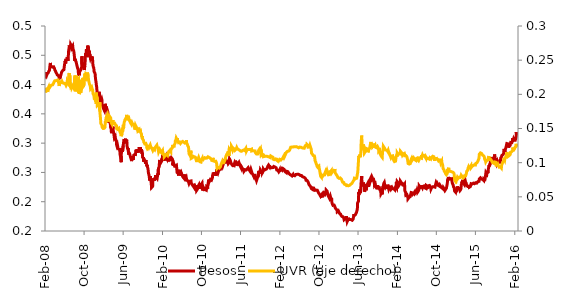
| Category | Pesos |
|---|---|
| 2003-01-02 | 0.508 |
| 2003-01-03 | 0.502 |
| 2003-01-07 | 0.516 |
| 2003-01-08 | 0.505 |
| 2003-01-09 | 0.508 |
| 2003-01-10 | 0.504 |
| 2003-01-13 | 0.498 |
| 2003-01-14 | 0.496 |
| 2003-01-15 | 0.486 |
| 2003-01-16 | 0.492 |
| 2003-01-17 | 0.501 |
| 2003-01-20 | 0.519 |
| 2003-01-21 | 0.519 |
| 2003-01-22 | 0.528 |
| 2003-01-23 | 0.523 |
| 2003-01-24 | 0.523 |
| 2003-01-27 | 0.522 |
| 2003-01-28 | 0.528 |
| 2003-01-29 | 0.524 |
| 2003-01-30 | 0.517 |
| 2003-01-31 | 0.516 |
| 2003-02-03 | 0.527 |
| 2003-02-04 | 0.526 |
| 2003-02-05 | 0.531 |
| 2003-02-06 | 0.538 |
| 2003-02-07 | 0.53 |
| 2003-02-10 | 0.536 |
| 2003-02-11 | 0.538 |
| 2003-02-12 | 0.52 |
| 2003-02-13 | 0.527 |
| 2003-02-14 | 0.528 |
| 2003-02-17 | 0.522 |
| 2003-02-18 | 0.523 |
| 2003-02-19 | 0.523 |
| 2003-02-20 | 0.525 |
| 2003-02-21 | 0.528 |
| 2003-02-24 | 0.53 |
| 2003-02-25 | 0.53 |
| 2003-02-26 | 0.523 |
| 2003-02-27 | 0.53 |
| 2003-02-28 | 0.528 |
| 2003-03-03 | 0.539 |
| 2003-03-04 | 0.536 |
| 2003-03-05 | 0.533 |
| 2003-03-06 | 0.516 |
| 2003-03-07 | 0.529 |
| 2003-03-10 | 0.523 |
| 2003-03-11 | 0.527 |
| 2003-03-12 | 0.529 |
| 2003-03-13 | 0.534 |
| 2003-03-14 | 0.534 |
| 2003-03-17 | 0.527 |
| 2003-03-18 | 0.527 |
| 2003-03-19 | 0.527 |
| 2003-03-20 | 0.526 |
| 2003-03-21 | 0.535 |
| 2003-03-25 | 0.529 |
| 2003-03-26 | 0.528 |
| 2003-03-27 | 0.527 |
| 2003-03-28 | 0.524 |
| 2003-03-31 | 0.536 |
| 2003-04-01 | 0.525 |
| 2003-04-02 | 0.524 |
| 2003-04-03 | 0.536 |
| 2003-04-04 | 0.538 |
| 2003-04-07 | 0.535 |
| 2003-04-08 | 0.538 |
| 2003-04-09 | 0.532 |
| 2003-04-10 | 0.53 |
| 2003-04-11 | 0.54 |
| 2003-04-14 | 0.533 |
| 2003-04-15 | 0.532 |
| 2003-04-16 | 0.536 |
| 2003-04-21 | 0.541 |
| 2003-04-22 | 0.536 |
| 2003-04-23 | 0.524 |
| 2003-04-24 | 0.529 |
| 2003-04-25 | 0.529 |
| 2003-04-28 | 0.537 |
| 2003-04-29 | 0.529 |
| 2003-05-05 | 0.509 |
| 2003-05-06 | 0.502 |
| 2003-05-07 | 0.499 |
| 2003-05-08 | 0.487 |
| 2003-05-09 | 0.495 |
| 2003-05-12 | 0.487 |
| 2003-05-13 | 0.479 |
| 2003-05-14 | 0.491 |
| 2003-05-15 | 0.501 |
| 2003-05-16 | 0.505 |
| 2003-05-19 | 0.53 |
| 2003-05-20 | 0.529 |
| 2003-05-21 | 0.527 |
| 2003-05-22 | 0.514 |
| 2003-05-23 | 0.503 |
| 2003-05-26 | 0.502 |
| 2003-05-27 | 0.503 |
| 2003-05-28 | 0.506 |
| 2003-05-29 | 0.501 |
| 2003-05-30 | 0.498 |
| 2003-06-03 | 0.5 |
| 2003-06-04 | 0.502 |
| 2003-06-05 | 0.503 |
| 2003-06-06 | 0.498 |
| 2003-06-09 | 0.5 |
| 2003-06-10 | 0.506 |
| 2003-06-11 | 0.503 |
| 2003-06-12 | 0.504 |
| 2003-06-13 | 0.505 |
| 2003-06-16 | 0.506 |
| 2003-06-17 | 0.503 |
| 2003-06-18 | 0.499 |
| 2003-06-19 | 0.5 |
| 2003-06-20 | 0.498 |
| 2003-06-24 | 0.496 |
| 2003-06-25 | 0.492 |
| 2003-06-26 | 0.49 |
| 2003-06-27 | 0.49 |
| 2003-07-01 | 0.489 |
| 2003-07-02 | 0.486 |
| 2003-07-03 | 0.488 |
| 2003-07-04 | 0.488 |
| 2003-07-07 | 0.489 |
| 2003-07-08 | 0.504 |
| 2003-07-09 | 0.498 |
| 2003-07-10 | 0.498 |
| 2003-07-11 | 0.498 |
| 2003-07-14 | 0.502 |
| 2003-07-15 | 0.504 |
| 2003-07-16 | 0.508 |
| 2003-07-17 | 0.504 |
| 2003-07-18 | 0.5 |
| 2003-07-21 | 0.501 |
| 2003-07-22 | 0.504 |
| 2003-07-23 | 0.504 |
| 2003-07-24 | 0.506 |
| 2003-07-25 | 0.505 |
| 2003-07-28 | 0.505 |
| 2003-07-29 | 0.504 |
| 2003-07-30 | 0.502 |
| 2003-07-31 | 0.5 |
| 2003-08-01 | 0.502 |
| 2003-08-04 | 0.509 |
| 2003-08-05 | 0.508 |
| 2003-08-06 | 0.505 |
| 2003-08-08 | 0.503 |
| 2003-08-11 | 0.5 |
| 2003-08-12 | 0.499 |
| 2003-08-13 | 0.497 |
| 2003-08-14 | 0.496 |
| 2003-08-15 | 0.496 |
| 2003-08-19 | 0.497 |
| 2003-08-20 | 0.495 |
| 2003-08-21 | 0.495 |
| 2003-08-22 | 0.493 |
| 2003-08-25 | 0.498 |
| 2003-08-26 | 0.499 |
| 2003-08-27 | 0.498 |
| 2003-08-28 | 0.498 |
| 2003-08-29 | 0.493 |
| 2003-09-01 | 0.491 |
| 2003-09-02 | 0.496 |
| 2003-09-03 | 0.491 |
| 2003-09-04 | 0.488 |
| 2003-09-05 | 0.489 |
| 2003-09-08 | 0.493 |
| 2003-09-09 | 0.489 |
| 2003-09-10 | 0.49 |
| 2003-09-11 | 0.488 |
| 2003-09-12 | 0.488 |
| 2003-09-15 | 0.487 |
| 2003-09-16 | 0.486 |
| 2003-09-17 | 0.486 |
| 2003-09-18 | 0.489 |
| 2003-09-19 | 0.492 |
| 2003-09-22 | 0.494 |
| 2003-09-23 | 0.501 |
| 2003-09-24 | 0.499 |
| 2003-09-25 | 0.494 |
| 2003-09-26 | 0.497 |
| 2003-09-29 | 0.505 |
| 2003-09-30 | 0.505 |
| 2003-10-01 | 0.506 |
| 2003-10-02 | 0.503 |
| 2003-10-03 | 0.499 |
| 2003-10-06 | 0.503 |
| 2003-10-07 | 0.503 |
| 2003-10-08 | 0.496 |
| 2003-10-09 | 0.505 |
| 2003-10-10 | 0.506 |
| 2003-10-14 | 0.503 |
| 2003-10-15 | 0.506 |
| 2003-10-16 | 0.503 |
| 2003-10-17 | 0.504 |
| 2003-10-20 | 0.505 |
| 2003-10-21 | 0.504 |
| 2003-10-22 | 0.503 |
| 2003-10-23 | 0.501 |
| 2003-10-24 | 0.493 |
| 2003-10-27 | 0.501 |
| 2003-10-28 | 0.5 |
| 2003-10-29 | 0.493 |
| 2003-10-30 | 0.499 |
| 2003-10-31 | 0.493 |
| 2003-11-04 | 0.494 |
| 2003-11-05 | 0.491 |
| 2003-11-06 | 0.492 |
| 2003-11-07 | 0.491 |
| 2003-11-10 | 0.491 |
| 2003-11-11 | 0.49 |
| 2003-11-12 | 0.488 |
| 2003-11-13 | 0.488 |
| 2003-11-14 | 0.488 |
| 2003-11-18 | 0.486 |
| 2003-11-19 | 0.486 |
| 2003-11-20 | 0.489 |
| 2003-11-21 | 0.489 |
| 2003-11-24 | 0.486 |
| 2003-11-25 | 0.484 |
| 2003-11-26 | 0.483 |
| 2003-11-27 | 0.484 |
| 2003-11-28 | 0.486 |
| 2003-11-30 | 0.486 |
| 2003-12-01 | 0.486 |
| 2003-12-02 | 0.487 |
| 2003-12-03 | 0.489 |
| 2003-12-04 | 0.489 |
| 2003-12-05 | 0.489 |
| 2003-12-09 | 0.49 |
| 2003-12-10 | 0.486 |
| 2003-12-11 | 0.488 |
| 2003-12-12 | 0.489 |
| 2003-12-15 | 0.491 |
| 2003-12-16 | 0.491 |
| 2003-12-17 | 0.49 |
| 2003-12-18 | 0.49 |
| 2003-12-19 | 0.49 |
| 2003-12-22 | 0.487 |
| 2003-12-23 | 0.489 |
| 2003-12-24 | 0.489 |
| 2003-12-26 | 0.488 |
| 2003-12-29 | 0.49 |
| 2003-12-31 | 0.495 |
| 2004-01-02 | 0.486 |
| 2004-01-05 | 0.485 |
| 2004-01-06 | 0.481 |
| 2004-01-07 | 0.477 |
| 2004-01-08 | 0.476 |
| 2004-01-09 | 0.478 |
| 2004-01-13 | 0.477 |
| 2004-01-14 | 0.471 |
| 2004-01-15 | 0.472 |
| 2004-01-16 | 0.478 |
| 2004-01-19 | 0.482 |
| 2004-01-20 | 0.478 |
| 2004-01-21 | 0.478 |
| 2004-01-22 | 0.48 |
| 2004-01-23 | 0.481 |
| 2004-01-26 | 0.483 |
| 2004-01-27 | 0.478 |
| 2004-01-28 | 0.476 |
| 2004-01-29 | 0.481 |
| 2004-01-30 | 0.481 |
| 2004-01-31 | 0.481 |
| 2004-02-02 | 0.481 |
| 2004-02-03 | 0.481 |
| 2004-02-04 | 0.478 |
| 2004-02-05 | 0.476 |
| 2004-02-06 | 0.477 |
| 2004-02-09 | 0.475 |
| 2004-02-10 | 0.475 |
| 2004-02-11 | 0.475 |
| 2004-02-12 | 0.472 |
| 2004-02-13 | 0.47 |
| 2004-02-16 | 0.471 |
| 2004-02-17 | 0.472 |
| 2004-02-18 | 0.469 |
| 2004-02-19 | 0.468 |
| 2004-02-20 | 0.466 |
| 2004-02-23 | 0.461 |
| 2004-02-24 | 0.457 |
| 2004-02-25 | 0.463 |
| 2004-02-26 | 0.458 |
| 2004-02-27 | 0.453 |
| 2004-02-29 | 0.453 |
| 2004-03-01 | 0.457 |
| 2004-03-02 | 0.455 |
| 2004-03-03 | 0.45 |
| 2004-03-04 | 0.449 |
| 2004-03-05 | 0.442 |
| 2004-03-06 | 0.442 |
| 2004-03-07 | 0.442 |
| 2004-03-08 | 0.44 |
| 2004-03-09 | 0.44 |
| 2004-03-10 | 0.446 |
| 2004-03-11 | 0.444 |
| 2004-03-12 | 0.444 |
| 2004-03-13 | 0.444 |
| 2004-03-14 | 0.444 |
| 2004-03-15 | 0.44 |
| 2004-03-16 | 0.439 |
| 2004-03-17 | 0.436 |
| 2004-03-18 | 0.436 |
| 2004-03-19 | 0.436 |
| 2004-03-20 | 0.436 |
| 2004-03-21 | 0.436 |
| 2004-03-22 | 0.436 |
| 2004-03-23 | 0.437 |
| 2004-03-24 | 0.435 |
| 2004-03-25 | 0.434 |
| 2004-03-26 | 0.43 |
| 2004-03-27 | 0.43 |
| 2004-03-28 | 0.43 |
| 2004-03-29 | 0.432 |
| 2004-03-30 | 0.431 |
| 2004-03-31 | 0.429 |
| 2004-04-01 | 0.427 |
| 2004-04-02 | 0.43 |
| 2004-04-03 | 0.43 |
| 2004-04-04 | 0.43 |
| 2004-04-05 | 0.432 |
| 2004-04-06 | 0.431 |
| 2004-04-07 | 0.429 |
| 2004-04-08 | 0.429 |
| 2004-04-09 | 0.429 |
| 2004-04-10 | 0.429 |
| 2004-04-11 | 0.429 |
| 2004-04-12 | 0.429 |
| 2004-04-13 | 0.429 |
| 2004-04-14 | 0.43 |
| 2004-04-15 | 0.436 |
| 2004-04-16 | 0.446 |
| 2004-04-17 | 0.446 |
| 2004-04-18 | 0.446 |
| 2004-04-19 | 0.441 |
| 2004-04-20 | 0.454 |
| 2004-04-21 | 0.446 |
| 2004-04-22 | 0.444 |
| 2004-04-23 | 0.443 |
| 2004-04-24 | 0.443 |
| 2004-04-25 | 0.443 |
| 2004-04-26 | 0.442 |
| 2004-04-27 | 0.442 |
| 2004-04-28 | 0.447 |
| 2004-04-29 | 0.452 |
| 2004-04-30 | 0.455 |
| 2004-05-01 | 0.455 |
| 2004-05-02 | 0.455 |
| 2004-05-03 | 0.457 |
| 2004-05-04 | 0.47 |
| 2004-05-05 | 0.471 |
| 2004-05-06 | 0.496 |
| 2004-05-07 | 0.508 |
| 2004-05-08 | 0.508 |
| 2004-05-09 | 0.508 |
| 2004-05-10 | 0.514 |
| 2004-05-11 | 0.503 |
| 2004-05-12 | 0.499 |
| 2004-05-13 | 0.498 |
| 2004-05-14 | 0.489 |
| 2004-05-15 | 0.489 |
| 2004-05-16 | 0.489 |
| 2004-05-17 | 0.484 |
| 2004-05-18 | 0.484 |
| 2004-05-19 | 0.487 |
| 2004-05-20 | 0.492 |
| 2004-05-21 | 0.494 |
| 2004-05-22 | 0.494 |
| 2004-05-23 | 0.494 |
| 2004-05-24 | 0.494 |
| 2004-05-25 | 0.484 |
| 2004-05-26 | 0.486 |
| 2004-05-27 | 0.483 |
| 2004-05-28 | 0.479 |
| 2004-05-29 | 0.479 |
| 2004-05-30 | 0.479 |
| 2004-05-31 | 0.478 |
| 2004-06-01 | 0.483 |
| 2004-06-02 | 0.481 |
| 2004-06-03 | 0.478 |
| 2004-06-04 | 0.475 |
| 2004-06-05 | 0.475 |
| 2004-06-06 | 0.475 |
| 2004-06-07 | 0.471 |
| 2004-06-08 | 0.476 |
| 2004-06-09 | 0.481 |
| 2004-06-10 | 0.49 |
| 2004-06-11 | 0.488 |
| 2004-06-12 | 0.488 |
| 2004-06-13 | 0.488 |
| 2004-06-14 | 0.488 |
| 2004-06-15 | 0.486 |
| 2004-06-16 | 0.486 |
| 2004-06-17 | 0.485 |
| 2004-06-18 | 0.484 |
| 2004-06-19 | 0.484 |
| 2004-06-20 | 0.484 |
| 2004-06-21 | 0.484 |
| 2004-06-22 | 0.484 |
| 2004-06-23 | 0.486 |
| 2004-06-24 | 0.484 |
| 2004-06-25 | 0.483 |
| 2004-06-26 | 0.483 |
| 2004-06-27 | 0.483 |
| 2004-06-28 | 0.485 |
| 2004-06-29 | 0.486 |
| 2004-06-30 | 0.485 |
| 2004-07-01 | 0.476 |
| 2004-07-02 | 0.476 |
| 2004-07-03 | 0.476 |
| 2004-07-04 | 0.476 |
| 2004-07-05 | 0.476 |
| 2004-07-06 | 0.48 |
| 2004-07-07 | 0.481 |
| 2004-07-08 | 0.48 |
| 2004-07-09 | 0.48 |
| 2004-07-10 | 0.48 |
| 2004-07-11 | 0.48 |
| 2004-07-12 | 0.481 |
| 2004-07-13 | 0.481 |
| 2004-07-14 | 0.48 |
| 2004-07-15 | 0.48 |
| 2004-07-16 | 0.48 |
| 2004-07-17 | 0.48 |
| 2004-07-18 | 0.48 |
| 2004-07-19 | 0.48 |
| 2004-07-20 | 0.48 |
| 2004-07-21 | 0.483 |
| 2004-07-22 | 0.483 |
| 2004-07-23 | 0.482 |
| 2004-07-24 | 0.482 |
| 2004-07-25 | 0.482 |
| 2004-07-26 | 0.486 |
| 2004-07-27 | 0.487 |
| 2004-07-28 | 0.485 |
| 2004-07-29 | 0.485 |
| 2004-07-30 | 0.485 |
| 2004-07-31 | 0.485 |
| 2004-08-01 | 0.485 |
| 2004-08-02 | 0.486 |
| 2004-08-03 | 0.492 |
| 2004-08-04 | 0.492 |
| 2004-08-05 | 0.491 |
| 2004-08-06 | 0.49 |
| 2004-08-07 | 0.49 |
| 2004-08-08 | 0.49 |
| 2004-08-09 | 0.485 |
| 2004-08-10 | 0.484 |
| 2004-08-11 | 0.485 |
| 2004-08-12 | 0.491 |
| 2004-08-13 | 0.485 |
| 2004-08-14 | 0.485 |
| 2004-08-15 | 0.485 |
| 2004-08-16 | 0.485 |
| 2004-08-17 | 0.483 |
| 2004-08-18 | 0.484 |
| 2004-08-19 | 0.484 |
| 2004-08-20 | 0.482 |
| 2004-08-21 | 0.482 |
| 2004-08-22 | 0.482 |
| 2004-08-23 | 0.479 |
| 2004-08-24 | 0.474 |
| 2004-08-25 | 0.473 |
| 2004-08-26 | 0.478 |
| 2004-08-27 | 0.478 |
| 2004-08-28 | 0.478 |
| 2004-08-29 | 0.478 |
| 2004-08-30 | 0.474 |
| 2004-08-31 | 0.472 |
| 2004-09-01 | 0.473 |
| 2004-09-02 | 0.48 |
| 2004-09-03 | 0.478 |
| 2004-09-04 | 0.478 |
| 2004-09-05 | 0.478 |
| 2004-09-06 | 0.48 |
| 2004-09-07 | 0.479 |
| 2004-09-08 | 0.473 |
| 2004-09-09 | 0.464 |
| 2004-09-10 | 0.469 |
| 2004-09-11 | 0.469 |
| 2004-09-12 | 0.469 |
| 2004-09-13 | 0.458 |
| 2004-09-14 | 0.453 |
| 2004-09-15 | 0.458 |
| 2004-09-16 | 0.453 |
| 2004-09-17 | 0.452 |
| 2004-09-18 | 0.452 |
| 2004-09-19 | 0.452 |
| 2004-09-20 | 0.459 |
| 2004-09-21 | 0.461 |
| 2004-09-22 | 0.459 |
| 2004-09-23 | 0.461 |
| 2004-09-24 | 0.469 |
| 2004-09-25 | 0.469 |
| 2004-09-26 | 0.469 |
| 2004-09-27 | 0.469 |
| 2004-09-28 | 0.47 |
| 2004-09-29 | 0.467 |
| 2004-09-30 | 0.468 |
| 2004-10-01 | 0.469 |
| 2004-10-02 | 0.469 |
| 2004-10-03 | 0.469 |
| 2004-10-04 | 0.472 |
| 2004-10-05 | 0.466 |
| 2004-10-06 | 0.463 |
| 2004-10-07 | 0.461 |
| 2004-10-08 | 0.457 |
| 2004-10-09 | 0.457 |
| 2004-10-10 | 0.457 |
| 2004-10-11 | 0.459 |
| 2004-10-12 | 0.461 |
| 2004-10-13 | 0.456 |
| 2004-10-14 | 0.456 |
| 2004-10-15 | 0.45 |
| 2004-10-16 | 0.45 |
| 2004-10-17 | 0.45 |
| 2004-10-18 | 0.45 |
| 2004-10-19 | 0.45 |
| 2004-10-20 | 0.45 |
| 2004-10-21 | 0.451 |
| 2004-10-22 | 0.45 |
| 2004-10-23 | 0.45 |
| 2004-10-24 | 0.45 |
| 2004-10-25 | 0.45 |
| 2004-10-26 | 0.451 |
| 2004-10-27 | 0.452 |
| 2004-10-28 | 0.456 |
| 2004-10-29 | 0.457 |
| 2004-10-30 | 0.457 |
| 2004-10-31 | 0.457 |
| 2004-11-01 | 0.457 |
| 2004-11-02 | 0.452 |
| 2004-11-03 | 0.452 |
| 2004-11-04 | 0.452 |
| 2004-11-05 | 0.451 |
| 2004-11-06 | 0.451 |
| 2004-11-07 | 0.451 |
| 2004-11-08 | 0.45 |
| 2004-11-09 | 0.449 |
| 2004-11-10 | 0.45 |
| 2004-11-11 | 0.449 |
| 2004-11-12 | 0.447 |
| 2004-11-13 | 0.447 |
| 2004-11-14 | 0.447 |
| 2004-11-15 | 0.447 |
| 2004-11-16 | 0.445 |
| 2004-11-17 | 0.443 |
| 2004-11-18 | 0.441 |
| 2004-11-19 | 0.441 |
| 2004-11-20 | 0.441 |
| 2004-11-21 | 0.441 |
| 2004-11-22 | 0.441 |
| 2004-11-23 | 0.44 |
| 2004-11-24 | 0.436 |
| 2004-11-25 | 0.434 |
| 2004-11-26 | 0.429 |
| 2004-11-27 | 0.429 |
| 2004-11-28 | 0.429 |
| 2004-11-29 | 0.436 |
| 2004-11-30 | 0.436 |
| 2004-12-01 | 0.439 |
| 2004-12-02 | 0.443 |
| 2004-12-03 | 0.441 |
| 2004-12-04 | 0.441 |
| 2004-12-05 | 0.441 |
| 2004-12-06 | 0.441 |
| 2004-12-07 | 0.442 |
| 2004-12-08 | 0.442 |
| 2004-12-09 | 0.45 |
| 2004-12-10 | 0.445 |
| 2004-12-11 | 0.445 |
| 2004-12-12 | 0.445 |
| 2004-12-13 | 0.443 |
| 2004-12-14 | 0.443 |
| 2004-12-15 | 0.443 |
| 2004-12-16 | 0.44 |
| 2004-12-17 | 0.439 |
| 2004-12-18 | 0.439 |
| 2004-12-19 | 0.439 |
| 2004-12-20 | 0.431 |
| 2004-12-21 | 0.43 |
| 2004-12-22 | 0.427 |
| 2004-12-23 | 0.427 |
| 2004-12-24 | 0.428 |
| 2004-12-25 | 0.428 |
| 2004-12-26 | 0.428 |
| 2004-12-27 | 0.426 |
| 2004-12-28 | 0.426 |
| 2004-12-29 | 0.427 |
| 2004-12-30 | 0.426 |
| 2004-12-31 | 0.426 |
| 2005-01-01 | 0.426 |
| 2005-01-02 | 0.426 |
| 2005-01-03 | 0.417 |
| 2005-01-04 | 0.412 |
| 2005-01-05 | 0.415 |
| 2005-01-06 | 0.421 |
| 2005-01-07 | 0.419 |
| 2005-01-08 | 0.419 |
| 2005-01-09 | 0.419 |
| 2005-01-10 | 0.419 |
| 2005-01-11 | 0.42 |
| 2005-01-12 | 0.414 |
| 2005-01-13 | 0.411 |
| 2005-01-14 | 0.414 |
| 2005-01-15 | 0.414 |
| 2005-01-16 | 0.414 |
| 2005-01-17 | 0.42 |
| 2005-01-18 | 0.417 |
| 2005-01-19 | 0.415 |
| 2005-01-20 | 0.417 |
| 2005-01-21 | 0.415 |
| 2005-01-22 | 0.415 |
| 2005-01-23 | 0.415 |
| 2005-01-24 | 0.415 |
| 2005-01-25 | 0.408 |
| 2005-01-26 | 0.408 |
| 2005-01-27 | 0.41 |
| 2005-01-28 | 0.408 |
| 2005-01-29 | 0.408 |
| 2005-01-30 | 0.408 |
| 2005-01-31 | 0.407 |
| 2005-02-01 | 0.407 |
| 2005-02-02 | 0.407 |
| 2005-02-03 | 0.41 |
| 2005-02-04 | 0.409 |
| 2005-02-05 | 0.409 |
| 2005-02-06 | 0.409 |
| 2005-02-07 | 0.408 |
| 2005-02-08 | 0.408 |
| 2005-02-09 | 0.406 |
| 2005-02-10 | 0.405 |
| 2005-02-11 | 0.405 |
| 2005-02-12 | 0.405 |
| 2005-02-13 | 0.405 |
| 2005-02-14 | 0.404 |
| 2005-02-15 | 0.403 |
| 2005-02-16 | 0.404 |
| 2005-02-17 | 0.4 |
| 2005-02-18 | 0.401 |
| 2005-02-19 | 0.401 |
| 2005-02-20 | 0.401 |
| 2005-02-21 | 0.401 |
| 2005-02-22 | 0.4 |
| 2005-02-23 | 0.402 |
| 2005-02-24 | 0.402 |
| 2005-02-25 | 0.404 |
| 2005-02-26 | 0.404 |
| 2005-02-27 | 0.404 |
| 2005-02-28 | 0.402 |
| 2005-03-01 | 0.403 |
| 2005-03-02 | 0.405 |
| 2005-03-03 | 0.404 |
| 2005-03-04 | 0.404 |
| 2005-03-05 | 0.404 |
| 2005-03-06 | 0.404 |
| 2005-03-07 | 0.401 |
| 2005-03-08 | 0.403 |
| 2005-03-09 | 0.403 |
| 2005-03-10 | 0.403 |
| 2005-03-11 | 0.405 |
| 2005-03-12 | 0.405 |
| 2005-03-13 | 0.405 |
| 2005-03-14 | 0.41 |
| 2005-03-15 | 0.411 |
| 2005-03-16 | 0.416 |
| 2005-03-17 | 0.411 |
| 2005-03-18 | 0.415 |
| 2005-03-19 | 0.415 |
| 2005-03-20 | 0.415 |
| 2005-03-21 | 0.415 |
| 2005-03-22 | 0.411 |
| 2005-03-23 | 0.415 |
| 2005-03-24 | 0.415 |
| 2005-03-25 | 0.415 |
| 2005-03-26 | 0.415 |
| 2005-03-27 | 0.415 |
| 2005-03-28 | 0.427 |
| 2005-03-29 | 0.425 |
| 2005-03-30 | 0.42 |
| 2005-03-31 | 0.416 |
| 2005-04-01 | 0.416 |
| 2005-04-02 | 0.416 |
| 2005-04-03 | 0.416 |
| 2005-04-04 | 0.416 |
| 2005-04-05 | 0.417 |
| 2005-04-06 | 0.415 |
| 2005-04-07 | 0.412 |
| 2005-04-08 | 0.415 |
| 2005-04-09 | 0.415 |
| 2005-04-10 | 0.415 |
| 2005-04-11 | 0.413 |
| 2005-04-12 | 0.415 |
| 2005-04-13 | 0.408 |
| 2005-04-14 | 0.411 |
| 2005-04-15 | 0.41 |
| 2005-04-16 | 0.41 |
| 2005-04-17 | 0.41 |
| 2005-04-18 | 0.412 |
| 2005-04-19 | 0.41 |
| 2005-04-20 | 0.41 |
| 2005-04-21 | 0.409 |
| 2005-04-22 | 0.409 |
| 2005-04-23 | 0.409 |
| 2005-04-24 | 0.409 |
| 2005-04-25 | 0.407 |
| 2005-04-26 | 0.405 |
| 2005-04-27 | 0.402 |
| 2005-04-28 | 0.403 |
| 2005-04-29 | 0.403 |
| 2005-04-30 | 0.403 |
| 2005-05-01 | 0.403 |
| 2005-05-02 | 0.403 |
| 2005-05-03 | 0.401 |
| 2005-05-04 | 0.398 |
| 2005-05-05 | 0.399 |
| 2005-05-06 | 0.399 |
| 2005-05-07 | 0.399 |
| 2005-05-08 | 0.399 |
| 2005-05-09 | 0.399 |
| 2005-05-10 | 0.4 |
| 2005-05-11 | 0.402 |
| 2005-05-12 | 0.401 |
| 2005-05-13 | 0.401 |
| 2005-05-14 | 0.401 |
| 2005-05-15 | 0.401 |
| 2005-05-16 | 0.4 |
| 2005-05-17 | 0.397 |
| 2005-05-18 | 0.397 |
| 2005-05-19 | 0.395 |
| 2005-05-20 | 0.394 |
| 2005-05-21 | 0.394 |
| 2005-05-22 | 0.394 |
| 2005-05-23 | 0.394 |
| 2005-05-24 | 0.393 |
| 2005-05-25 | 0.392 |
| 2005-05-26 | 0.392 |
| 2005-05-27 | 0.392 |
| 2005-05-28 | 0.392 |
| 2005-05-29 | 0.392 |
| 2005-05-30 | 0.392 |
| 2005-05-31 | 0.393 |
| 2005-06-01 | 0.387 |
| 2005-06-02 | 0.384 |
| 2005-06-03 | 0.383 |
| 2005-06-04 | 0.383 |
| 2005-06-05 | 0.383 |
| 2005-06-06 | 0.383 |
| 2005-06-07 | 0.385 |
| 2005-06-08 | 0.389 |
| 2005-06-09 | 0.392 |
| 2005-06-10 | 0.389 |
| 2005-06-11 | 0.389 |
| 2005-06-12 | 0.389 |
| 2005-06-13 | 0.386 |
| 2005-06-14 | 0.382 |
| 2005-06-15 | 0.383 |
| 2005-06-16 | 0.381 |
| 2005-06-17 | 0.378 |
| 2005-06-18 | 0.378 |
| 2005-06-19 | 0.378 |
| 2005-06-20 | 0.378 |
| 2005-06-21 | 0.374 |
| 2005-06-22 | 0.371 |
| 2005-06-23 | 0.369 |
| 2005-06-24 | 0.369 |
| 2005-06-25 | 0.369 |
| 2005-06-26 | 0.369 |
| 2005-06-27 | 0.369 |
| 2005-06-28 | 0.371 |
| 2005-06-29 | 0.372 |
| 2005-06-30 | 0.37 |
| 2005-07-01 | 0.365 |
| 2005-07-02 | 0.365 |
| 2005-07-03 | 0.365 |
| 2005-07-04 | 0.365 |
| 2005-07-05 | 0.367 |
| 2005-07-06 | 0.365 |
| 2005-07-07 | 0.357 |
| 2005-07-08 | 0.351 |
| 2005-07-09 | 0.351 |
| 2005-07-10 | 0.351 |
| 2005-07-11 | 0.344 |
| 2005-07-12 | 0.34 |
| 2005-07-13 | 0.345 |
| 2005-07-14 | 0.344 |
| 2005-07-15 | 0.351 |
| 2005-07-16 | 0.351 |
| 2005-07-17 | 0.351 |
| 2005-07-18 | 0.35 |
| 2005-07-19 | 0.35 |
| 2005-07-20 | 0.35 |
| 2005-07-21 | 0.356 |
| 2005-07-22 | 0.355 |
| 2005-07-23 | 0.355 |
| 2005-07-24 | 0.355 |
| 2005-07-25 | 0.352 |
| 2005-07-26 | 0.352 |
| 2005-07-27 | 0.339 |
| 2005-07-28 | 0.339 |
| 2005-07-29 | 0.336 |
| 2005-07-30 | 0.336 |
| 2005-07-31 | 0.336 |
| 2005-08-01 | 0.34 |
| 2005-08-02 | 0.337 |
| 2005-08-03 | 0.334 |
| 2005-08-04 | 0.335 |
| 2005-08-05 | 0.335 |
| 2005-08-06 | 0.335 |
| 2005-08-07 | 0.335 |
| 2005-08-08 | 0.337 |
| 2005-08-09 | 0.338 |
| 2005-08-10 | 0.335 |
| 2005-08-11 | 0.335 |
| 2005-08-12 | 0.334 |
| 2005-08-13 | 0.334 |
| 2005-08-14 | 0.334 |
| 2005-08-15 | 0.334 |
| 2005-08-16 | 0.335 |
| 2005-08-17 | 0.336 |
| 2005-08-18 | 0.336 |
| 2005-08-19 | 0.338 |
| 2005-08-20 | 0.338 |
| 2005-08-21 | 0.338 |
| 2005-08-22 | 0.338 |
| 2005-08-23 | 0.337 |
| 2005-08-24 | 0.336 |
| 2005-08-25 | 0.339 |
| 2005-08-26 | 0.338 |
| 2005-08-27 | 0.338 |
| 2005-08-28 | 0.338 |
| 2005-08-29 | 0.333 |
| 2005-08-30 | 0.334 |
| 2005-08-31 | 0.333 |
| 2005-09-01 | 0.334 |
| 2005-09-02 | 0.331 |
| 2005-09-03 | 0.331 |
| 2005-09-04 | 0.331 |
| 2005-09-05 | 0.329 |
| 2005-09-06 | 0.326 |
| 2005-09-07 | 0.323 |
| 2005-09-08 | 0.322 |
| 2005-09-09 | 0.324 |
| 2005-09-10 | 0.324 |
| 2005-09-11 | 0.324 |
| 2005-09-12 | 0.324 |
| 2005-09-13 | 0.319 |
| 2005-09-14 | 0.314 |
| 2005-09-15 | 0.314 |
| 2005-09-16 | 0.314 |
| 2005-09-17 | 0.314 |
| 2005-09-18 | 0.314 |
| 2005-09-19 | 0.302 |
| 2005-09-20 | 0.302 |
| 2005-09-21 | 0.297 |
| 2005-09-22 | 0.295 |
| 2005-09-23 | 0.292 |
| 2005-09-24 | 0.292 |
| 2005-09-25 | 0.292 |
| 2005-09-26 | 0.286 |
| 2005-09-27 | 0.284 |
| 2005-09-28 | 0.284 |
| 2005-09-29 | 0.28 |
| 2005-09-30 | 0.276 |
| 2005-10-01 | 0.276 |
| 2005-10-02 | 0.276 |
| 2005-10-03 | 0.276 |
| 2005-10-04 | 0.271 |
| 2005-10-05 | 0.277 |
| 2005-10-06 | 0.286 |
| 2005-10-07 | 0.293 |
| 2005-10-08 | 0.293 |
| 2005-10-09 | 0.293 |
| 2005-10-10 | 0.296 |
| 2005-10-11 | 0.305 |
| 2005-10-12 | 0.311 |
| 2005-10-13 | 0.308 |
| 2005-10-14 | 0.306 |
| 2005-10-15 | 0.306 |
| 2005-10-16 | 0.306 |
| 2005-10-17 | 0.306 |
| 2005-10-18 | 0.303 |
| 2005-10-19 | 0.293 |
| 2005-10-20 | 0.29 |
| 2005-10-21 | 0.296 |
| 2005-10-22 | 0.296 |
| 2005-10-23 | 0.296 |
| 2005-10-24 | 0.293 |
| 2005-10-25 | 0.293 |
| 2005-10-26 | 0.297 |
| 2005-10-27 | 0.301 |
| 2005-10-28 | 0.306 |
| 2005-10-29 | 0.306 |
| 2005-10-30 | 0.306 |
| 2005-10-31 | 0.305 |
| 2005-11-01 | 0.304 |
| 2005-11-02 | 0.304 |
| 2005-11-03 | 0.304 |
| 2005-11-04 | 0.306 |
| 2005-11-05 | 0.306 |
| 2005-11-06 | 0.306 |
| 2005-11-07 | 0.306 |
| 2005-11-08 | 0.305 |
| 2005-11-09 | 0.306 |
| 2005-11-10 | 0.307 |
| 2005-11-11 | 0.306 |
| 2005-11-12 | 0.306 |
| 2005-11-13 | 0.306 |
| 2005-11-14 | 0.306 |
| 2005-11-15 | 0.308 |
| 2005-11-16 | 0.304 |
| 2005-11-17 | 0.301 |
| 2005-11-18 | 0.3 |
| 2005-11-19 | 0.3 |
| 2005-11-20 | 0.3 |
| 2005-11-21 | 0.297 |
| 2005-11-22 | 0.292 |
| 2005-11-23 | 0.285 |
| 2005-11-24 | 0.286 |
| 2005-11-25 | 0.283 |
| 2005-11-26 | 0.283 |
| 2005-11-27 | 0.283 |
| 2005-11-28 | 0.281 |
| 2005-11-29 | 0.286 |
| 2005-11-30 | 0.291 |
| 2005-12-01 | 0.287 |
| 2005-12-02 | 0.288 |
| 2005-12-03 | 0.288 |
| 2005-12-04 | 0.288 |
| 2005-12-05 | 0.291 |
| 2005-12-06 | 0.294 |
| 2005-12-07 | 0.293 |
| 2005-12-08 | 0.293 |
| 2005-12-09 | 0.293 |
| 2005-12-10 | 0.293 |
| 2005-12-11 | 0.293 |
| 2005-12-12 | 0.293 |
| 2005-12-13 | 0.293 |
| 2005-12-14 | 0.29 |
| 2005-12-15 | 0.291 |
| 2005-12-16 | 0.291 |
| 2005-12-17 | 0.291 |
| 2005-12-18 | 0.291 |
| 2005-12-19 | 0.294 |
| 2005-12-20 | 0.294 |
| 2005-12-21 | 0.293 |
| 2005-12-22 | 0.292 |
| 2005-12-23 | 0.291 |
| 2005-12-24 | 0.291 |
| 2005-12-25 | 0.291 |
| 2005-12-26 | 0.291 |
| 2005-12-27 | 0.292 |
| 2005-12-28 | 0.29 |
| 2005-12-29 | 0.291 |
| 2005-12-30 | 0.291 |
| 2005-12-31 | 0.291 |
| 2006-01-01 | 0.291 |
| 2006-01-02 | 0.288 |
| 2006-01-03 | 0.289 |
| 2006-01-04 | 0.288 |
| 2006-01-05 | 0.287 |
| 2006-01-06 | 0.287 |
| 2006-01-07 | 0.287 |
| 2006-01-08 | 0.287 |
| 2006-01-09 | 0.287 |
| 2006-01-10 | 0.284 |
| 2006-01-11 | 0.282 |
| 2006-01-12 | 0.28 |
| 2006-01-13 | 0.278 |
| 2006-01-14 | 0.278 |
| 2006-01-15 | 0.278 |
| 2006-01-16 | 0.277 |
| 2006-01-17 | 0.277 |
| 2006-01-18 | 0.277 |
| 2006-01-19 | 0.277 |
| 2006-01-20 | 0.275 |
| 2006-01-21 | 0.275 |
| 2006-01-22 | 0.275 |
| 2006-01-23 | 0.275 |
| 2006-01-24 | 0.273 |
| 2006-01-25 | 0.273 |
| 2006-01-26 | 0.274 |
| 2006-01-27 | 0.273 |
| 2006-01-28 | 0.273 |
| 2006-01-29 | 0.273 |
| 2006-01-30 | 0.273 |
| 2006-01-31 | 0.274 |
| 2006-02-01 | 0.274 |
| 2006-02-02 | 0.273 |
| 2006-02-03 | 0.272 |
| 2006-02-04 | 0.272 |
| 2006-02-05 | 0.272 |
| 2006-02-06 | 0.271 |
| 2006-02-07 | 0.268 |
| 2006-02-08 | 0.267 |
| 2006-02-09 | 0.266 |
| 2006-02-10 | 0.264 |
| 2006-02-11 | 0.264 |
| 2006-02-12 | 0.264 |
| 2006-02-13 | 0.263 |
| 2006-02-14 | 0.262 |
| 2006-02-15 | 0.262 |
| 2006-02-16 | 0.26 |
| 2006-02-17 | 0.257 |
| 2006-02-18 | 0.257 |
| 2006-02-19 | 0.257 |
| 2006-02-20 | 0.256 |
| 2006-02-21 | 0.256 |
| 2006-02-22 | 0.256 |
| 2006-02-23 | 0.251 |
| 2006-02-24 | 0.251 |
| 2006-02-25 | 0.251 |
| 2006-02-26 | 0.251 |
| 2006-02-27 | 0.251 |
| 2006-02-28 | 0.251 |
| 2006-03-01 | 0.251 |
| 2006-03-02 | 0.252 |
| 2006-03-03 | 0.255 |
| 2006-03-04 | 0.255 |
| 2006-03-05 | 0.255 |
| 2006-03-06 | 0.261 |
| 2006-03-07 | 0.263 |
| 2006-03-08 | 0.262 |
| 2006-03-09 | 0.262 |
| 2006-03-10 | 0.267 |
| 2006-03-11 | 0.267 |
| 2006-03-12 | 0.267 |
| 2006-03-13 | 0.266 |
| 2006-03-14 | 0.262 |
| 2006-03-15 | 0.261 |
| 2006-03-16 | 0.259 |
| 2006-03-17 | 0.258 |
| 2006-03-18 | 0.258 |
| 2006-03-19 | 0.258 |
| 2006-03-20 | 0.258 |
| 2006-03-21 | 0.259 |
| 2006-03-22 | 0.26 |
| 2006-03-23 | 0.263 |
| 2006-03-24 | 0.263 |
| 2006-03-25 | 0.263 |
| 2006-03-26 | 0.263 |
| 2006-03-27 | 0.263 |
| 2006-03-28 | 0.263 |
| 2006-03-29 | 0.263 |
| 2006-03-30 | 0.265 |
| 2006-03-31 | 0.265 |
| 2006-04-01 | 0.265 |
| 2006-04-02 | 0.265 |
| 2006-04-03 | 0.267 |
| 2006-04-04 | 0.265 |
| 2006-04-05 | 0.266 |
| 2006-04-06 | 0.27 |
| 2006-04-07 | 0.272 |
| 2006-04-08 | 0.272 |
| 2006-04-09 | 0.272 |
| 2006-04-10 | 0.28 |
| 2006-04-11 | 0.28 |
| 2006-04-12 | 0.278 |
| 2006-04-13 | 0.278 |
| 2006-04-14 | 0.278 |
| 2006-04-15 | 0.278 |
| 2006-04-16 | 0.278 |
| 2006-04-17 | 0.29 |
| 2006-04-18 | 0.289 |
| 2006-04-19 | 0.286 |
| 2006-04-20 | 0.283 |
| 2006-04-21 | 0.282 |
| 2006-04-22 | 0.282 |
| 2006-04-23 | 0.282 |
| 2006-04-24 | 0.28 |
| 2006-04-25 | 0.287 |
| 2006-04-26 | 0.295 |
| 2006-04-27 | 0.294 |
| 2006-04-28 | 0.294 |
| 2006-04-29 | 0.294 |
| 2006-04-30 | 0.294 |
| 2006-05-01 | 0.294 |
| 2006-05-02 | 0.305 |
| 2006-05-03 | 0.307 |
| 2006-05-04 | 0.313 |
| 2006-05-05 | 0.314 |
| 2006-05-06 | 0.314 |
| 2006-05-07 | 0.314 |
| 2006-05-08 | 0.309 |
| 2006-05-09 | 0.309 |
| 2006-05-10 | 0.306 |
| 2006-05-11 | 0.311 |
| 2006-05-12 | 0.319 |
| 2006-05-13 | 0.319 |
| 2006-05-14 | 0.319 |
| 2006-05-15 | 0.331 |
| 2006-05-16 | 0.325 |
| 2006-05-17 | 0.331 |
| 2006-05-18 | 0.341 |
| 2006-05-19 | 0.341 |
| 2006-05-20 | 0.341 |
| 2006-05-21 | 0.341 |
| 2006-05-22 | 0.348 |
| 2006-05-23 | 0.347 |
| 2006-05-24 | 0.354 |
| 2006-05-25 | 0.356 |
| 2006-05-26 | 0.341 |
| 2006-05-27 | 0.341 |
| 2006-05-28 | 0.341 |
| 2006-05-29 | 0.341 |
| 2006-05-30 | 0.346 |
| 2006-05-31 | 0.349 |
| 2006-06-01 | 0.344 |
| 2006-06-02 | 0.341 |
| 2006-06-03 | 0.341 |
| 2006-06-04 | 0.341 |
| 2006-06-05 | 0.338 |
| 2006-06-06 | 0.346 |
| 2006-06-07 | 0.343 |
| 2006-06-08 | 0.351 |
| 2006-06-09 | 0.35 |
| 2006-06-10 | 0.35 |
| 2006-06-11 | 0.35 |
| 2006-06-12 | 0.356 |
| 2006-06-13 | 0.365 |
| 2006-06-14 | 0.366 |
| 2006-06-15 | 0.365 |
| 2006-06-16 | 0.364 |
| 2006-06-17 | 0.364 |
| 2006-06-18 | 0.364 |
| 2006-06-19 | 0.364 |
| 2006-06-20 | 0.366 |
| 2006-06-21 | 0.365 |
| 2006-06-22 | 0.368 |
| 2006-06-23 | 0.377 |
| 2006-06-24 | 0.377 |
| 2006-06-25 | 0.377 |
| 2006-06-26 | 0.377 |
| 2006-06-27 | 0.383 |
| 2006-06-28 | 0.408 |
| 2006-06-29 | 0.404 |
| 2006-06-30 | 0.375 |
| 2006-07-01 | 0.375 |
| 2006-07-02 | 0.375 |
| 2006-07-03 | 0.375 |
| 2006-07-04 | 0.37 |
| 2006-07-05 | 0.381 |
| 2006-07-06 | 0.376 |
| 2006-07-07 | 0.371 |
| 2006-07-08 | 0.371 |
| 2006-07-09 | 0.371 |
| 2006-07-10 | 0.36 |
| 2006-07-11 | 0.361 |
| 2006-07-12 | 0.369 |
| 2006-07-13 | 0.374 |
| 2006-07-14 | 0.377 |
| 2006-07-15 | 0.377 |
| 2006-07-16 | 0.377 |
| 2006-07-17 | 0.378 |
| 2006-07-18 | 0.377 |
| 2006-07-19 | 0.375 |
| 2006-07-20 | 0.375 |
| 2006-07-21 | 0.364 |
| 2006-07-22 | 0.364 |
| 2006-07-23 | 0.364 |
| 2006-07-24 | 0.356 |
| 2006-07-25 | 0.359 |
| 2006-07-26 | 0.356 |
| 2006-07-27 | 0.351 |
| 2006-07-28 | 0.345 |
| 2006-07-29 | 0.345 |
| 2006-07-30 | 0.345 |
| 2006-07-31 | 0.344 |
| 2006-08-01 | 0.347 |
| 2006-08-02 | 0.347 |
| 2006-08-03 | 0.348 |
| 2006-08-04 | 0.34 |
| 2006-08-05 | 0.34 |
| 2006-08-06 | 0.34 |
| 2006-08-07 | 0.34 |
| 2006-08-08 | 0.341 |
| 2006-08-09 | 0.338 |
| 2006-08-10 | 0.337 |
| 2006-08-11 | 0.339 |
| 2006-08-12 | 0.339 |
| 2006-08-13 | 0.339 |
| 2006-08-14 | 0.344 |
| 2006-08-15 | 0.343 |
| 2006-08-16 | 0.341 |
| 2006-08-17 | 0.34 |
| 2006-08-18 | 0.338 |
| 2006-08-19 | 0.338 |
| 2006-08-20 | 0.338 |
| 2006-08-21 | 0.338 |
| 2006-08-22 | 0.339 |
| 2006-08-23 | 0.342 |
| 2006-08-24 | 0.347 |
| 2006-08-25 | 0.348 |
| 2006-08-26 | 0.348 |
| 2006-08-27 | 0.348 |
| 2006-08-28 | 0.348 |
| 2006-08-29 | 0.343 |
| 2006-08-30 | 0.344 |
| 2006-08-31 | 0.343 |
| 2006-09-01 | 0.343 |
| 2006-09-02 | 0.343 |
| 2006-09-03 | 0.343 |
| 2006-09-04 | 0.345 |
| 2006-09-05 | 0.344 |
| 2006-09-06 | 0.345 |
| 2006-09-07 | 0.346 |
| 2006-09-08 | 0.344 |
| 2006-09-09 | 0.344 |
| 2006-09-10 | 0.344 |
| 2006-09-11 | 0.345 |
| 2006-09-12 | 0.345 |
| 2006-09-13 | 0.342 |
| 2006-09-14 | 0.341 |
| 2006-09-15 | 0.34 |
| 2006-09-16 | 0.34 |
| 2006-09-17 | 0.34 |
| 2006-09-18 | 0.341 |
| 2006-09-19 | 0.339 |
| 2006-09-20 | 0.341 |
| 2006-09-21 | 0.345 |
| 2006-09-22 | 0.349 |
| 2006-09-23 | 0.349 |
| 2006-09-24 | 0.349 |
| 2006-09-25 | 0.352 |
| 2006-09-26 | 0.351 |
| 2006-09-27 | 0.347 |
| 2006-09-28 | 0.345 |
| 2006-09-29 | 0.346 |
| 2006-09-30 | 0.346 |
| 2006-10-01 | 0.346 |
| 2006-10-02 | 0.345 |
| 2006-10-03 | 0.346 |
| 2006-10-04 | 0.347 |
| 2006-10-05 | 0.344 |
| 2006-10-06 | 0.343 |
| 2006-10-07 | 0.343 |
| 2006-10-08 | 0.343 |
| 2006-10-09 | 0.34 |
| 2006-10-10 | 0.34 |
| 2006-10-11 | 0.342 |
| 2006-10-12 | 0.34 |
| 2006-10-13 | 0.34 |
| 2006-10-14 | 0.34 |
| 2006-10-15 | 0.34 |
| 2006-10-16 | 0.34 |
| 2006-10-17 | 0.34 |
| 2006-10-18 | 0.338 |
| 2006-10-19 | 0.339 |
| 2006-10-20 | 0.34 |
| 2006-10-21 | 0.34 |
| 2006-10-22 | 0.34 |
| 2006-10-23 | 0.341 |
| 2006-10-24 | 0.341 |
| 2006-10-25 | 0.34 |
| 2006-10-26 | 0.338 |
| 2006-10-27 | 0.336 |
| 2006-10-28 | 0.336 |
| 2006-10-29 | 0.336 |
| 2006-10-30 | 0.337 |
| 2006-10-31 | 0.335 |
| 2006-11-01 | 0.332 |
| 2006-11-02 | 0.329 |
| 2006-11-03 | 0.33 |
| 2006-11-04 | 0.33 |
| 2006-11-05 | 0.33 |
| 2006-11-06 | 0.33 |
| 2006-11-07 | 0.328 |
| 2006-11-08 | 0.327 |
| 2006-11-09 | 0.324 |
| 2006-11-10 | 0.326 |
| 2006-11-11 | 0.326 |
| 2006-11-12 | 0.326 |
| 2006-11-13 | 0.326 |
| 2006-11-14 | 0.323 |
| 2006-11-15 | 0.322 |
| 2006-11-16 | 0.322 |
| 2006-11-17 | 0.325 |
| 2006-11-18 | 0.325 |
| 2006-11-19 | 0.325 |
| 2006-11-20 | 0.325 |
| 2006-11-21 | 0.324 |
| 2006-11-22 | 0.326 |
| 2006-11-23 | 0.329 |
| 2006-11-24 | 0.329 |
| 2006-11-25 | 0.329 |
| 2006-11-26 | 0.329 |
| 2006-11-27 | 0.333 |
| 2006-11-28 | 0.335 |
| 2006-11-29 | 0.332 |
| 2006-11-30 | 0.332 |
| 2006-12-01 | 0.331 |
| 2006-12-02 | 0.331 |
| 2006-12-03 | 0.331 |
| 2006-12-04 | 0.33 |
| 2006-12-05 | 0.326 |
| 2006-12-06 | 0.326 |
| 2006-12-07 | 0.329 |
| 2006-12-08 | 0.329 |
| 2006-12-09 | 0.329 |
| 2006-12-10 | 0.329 |
| 2006-12-11 | 0.327 |
| 2006-12-12 | 0.327 |
| 2006-12-13 | 0.326 |
| 2006-12-14 | 0.327 |
| 2006-12-15 | 0.325 |
| 2006-12-16 | 0.325 |
| 2006-12-17 | 0.325 |
| 2006-12-18 | 0.324 |
| 2006-12-19 | 0.325 |
| 2006-12-20 | 0.325 |
| 2006-12-21 | 0.326 |
| 2006-12-22 | 0.325 |
| 2006-12-23 | 0.325 |
| 2006-12-24 | 0.325 |
| 2006-12-25 | 0.325 |
| 2006-12-26 | 0.324 |
| 2006-12-27 | 0.323 |
| 2006-12-28 | 0.323 |
| 2006-12-29 | 0.323 |
| 2006-12-30 | 0.323 |
| 2006-12-31 | 0.323 |
| 2007-01-01 | 0.323 |
| 2007-01-02 | 0.324 |
| 2007-01-03 | 0.323 |
| 2007-01-04 | 0.326 |
| 2007-01-05 | 0.329 |
| 2007-01-06 | 0.329 |
| 2007-01-07 | 0.329 |
| 2007-01-08 | 0.329 |
| 2007-01-09 | 0.334 |
| 2007-01-10 | 0.341 |
| 2007-01-11 | 0.338 |
| 2007-01-12 | 0.336 |
| 2007-01-13 | 0.336 |
| 2007-01-14 | 0.336 |
| 2007-01-15 | 0.334 |
| 2007-01-16 | 0.334 |
| 2007-01-17 | 0.333 |
| 2007-01-18 | 0.333 |
| 2007-01-19 | 0.333 |
| 2007-01-20 | 0.333 |
| 2007-01-21 | 0.333 |
| 2007-01-22 | 0.334 |
| 2007-01-23 | 0.337 |
| 2007-01-24 | 0.338 |
| 2007-01-25 | 0.339 |
| 2007-01-26 | 0.342 |
| 2007-01-27 | 0.342 |
| 2007-01-28 | 0.342 |
| 2007-01-29 | 0.343 |
| 2007-01-30 | 0.343 |
| 2007-01-31 | 0.342 |
| 2007-02-01 | 0.34 |
| 2007-02-02 | 0.344 |
| 2007-02-03 | 0.344 |
| 2007-02-04 | 0.344 |
| 2007-02-05 | 0.343 |
| 2007-02-06 | 0.345 |
| 2007-02-07 | 0.347 |
| 2007-02-08 | 0.349 |
| 2007-02-09 | 0.349 |
| 2007-02-10 | 0.349 |
| 2007-02-11 | 0.349 |
| 2007-02-12 | 0.351 |
| 2007-02-13 | 0.35 |
| 2007-02-14 | 0.347 |
| 2007-02-15 | 0.347 |
| 2007-02-16 | 0.348 |
| 2007-02-17 | 0.348 |
| 2007-02-18 | 0.348 |
| 2007-02-19 | 0.347 |
| 2007-02-20 | 0.348 |
| 2007-02-21 | 0.35 |
| 2007-02-22 | 0.35 |
| 2007-02-23 | 0.351 |
| 2007-02-24 | 0.351 |
| 2007-02-25 | 0.351 |
| 2007-02-26 | 0.351 |
| 2007-02-27 | 0.355 |
| 2007-02-28 | 0.359 |
| 2007-03-01 | 0.365 |
| 2007-03-02 | 0.364 |
| 2007-03-03 | 0.364 |
| 2007-03-04 | 0.364 |
| 2007-03-05 | 0.366 |
| 2007-03-06 | 0.361 |
| 2007-03-07 | 0.361 |
| 2007-03-08 | 0.361 |
| 2007-03-09 | 0.362 |
| 2007-03-10 | 0.362 |
| 2007-03-11 | 0.362 |
| 2007-03-12 | 0.36 |
| 2007-03-13 | 0.359 |
| 2007-03-14 | 0.363 |
| 2007-03-15 | 0.362 |
| 2007-03-16 | 0.361 |
| 2007-03-17 | 0.361 |
| 2007-03-19 | 0.361 |
| 2007-03-20 | 0.36 |
| 2007-03-21 | 0.36 |
| 2007-03-22 | 0.359 |
| 2007-03-23 | 0.361 |
| 2007-03-24 | 0.361 |
| 2007-03-25 | 0.361 |
| 2007-03-26 | 0.362 |
| 2007-03-27 | 0.36 |
| 2007-03-28 | 0.361 |
| 2007-03-29 | 0.362 |
| 2007-03-30 | 0.362 |
| 2007-03-31 | 0.362 |
| 2007-04-01 | 0.362 |
| 2007-04-02 | 0.366 |
| 2007-04-03 | 0.367 |
| 2007-04-04 | 0.366 |
| 2007-04-05 | 0.366 |
| 2007-04-06 | 0.366 |
| 2007-04-07 | 0.366 |
| 2007-04-08 | 0.366 |
| 2007-04-09 | 0.367 |
| 2007-04-10 | 0.367 |
| 2007-04-11 | 0.368 |
| 2007-04-12 | 0.37 |
| 2007-04-13 | 0.367 |
| 2007-04-14 | 0.367 |
| 2007-04-15 | 0.367 |
| 2007-04-16 | 0.369 |
| 2007-04-17 | 0.37 |
| 2007-04-18 | 0.373 |
| 2007-04-19 | 0.374 |
| 2007-04-20 | 0.371 |
| 2007-04-21 | 0.371 |
| 2007-04-22 | 0.371 |
| 2007-04-23 | 0.372 |
| 2007-04-24 | 0.373 |
| 2007-04-25 | 0.372 |
| 2007-04-26 | 0.373 |
| 2007-04-27 | 0.374 |
| 2007-04-28 | 0.374 |
| 2007-04-29 | 0.374 |
| 2007-04-30 | 0.372 |
| 2007-05-01 | 0.372 |
| 2007-05-02 | 0.376 |
| 2007-05-03 | 0.376 |
| 2007-05-04 | 0.376 |
| 2007-05-05 | 0.376 |
| 2007-05-06 | 0.376 |
| 2007-05-07 | 0.378 |
| 2007-05-08 | 0.378 |
| 2007-05-09 | 0.375 |
| 2007-05-10 | 0.374 |
| 2007-05-11 | 0.373 |
| 2007-05-12 | 0.373 |
| 2007-05-13 | 0.373 |
| 2007-05-14 | 0.375 |
| 2007-05-15 | 0.375 |
| 2007-05-16 | 0.375 |
| 2007-05-17 | 0.374 |
| 2007-05-18 | 0.373 |
| 2007-05-19 | 0.373 |
| 2007-05-20 | 0.373 |
| 2007-05-21 | 0.373 |
| 2007-05-22 | 0.37 |
| 2007-05-23 | 0.37 |
| 2007-05-24 | 0.372 |
| 2007-05-25 | 0.369 |
| 2007-05-26 | 0.369 |
| 2007-05-27 | 0.369 |
| 2007-05-28 | 0.368 |
| 2007-05-29 | 0.365 |
| 2007-05-30 | 0.366 |
| 2007-05-31 | 0.366 |
| 2007-06-01 | 0.366 |
| 2007-06-02 | 0.366 |
| 2007-06-03 | 0.366 |
| 2007-06-04 | 0.363 |
| 2007-06-05 | 0.364 |
| 2007-06-06 | 0.364 |
| 2007-06-07 | 0.367 |
| 2007-06-08 | 0.368 |
| 2007-06-09 | 0.368 |
| 2007-06-10 | 0.368 |
| 2007-06-11 | 0.368 |
| 2007-06-12 | 0.367 |
| 2007-06-13 | 0.365 |
| 2007-06-14 | 0.365 |
| 2007-06-15 | 0.363 |
| 2007-06-16 | 0.363 |
| 2007-06-17 | 0.363 |
| 2007-06-18 | 0.363 |
| 2007-06-19 | 0.364 |
| 2007-06-20 | 0.366 |
| 2007-06-21 | 0.37 |
| 2007-06-22 | 0.372 |
| 2007-06-23 | 0.372 |
| 2007-06-24 | 0.372 |
| 2007-06-25 | 0.372 |
| 2007-06-26 | 0.372 |
| 2007-06-27 | 0.373 |
| 2007-06-28 | 0.373 |
| 2007-06-29 | 0.371 |
| 2007-06-30 | 0.371 |
| 2007-07-01 | 0.371 |
| 2007-07-02 | 0.371 |
| 2007-07-03 | 0.371 |
| 2007-07-04 | 0.374 |
| 2007-07-05 | 0.374 |
| 2007-07-06 | 0.374 |
| 2007-07-07 | 0.374 |
| 2007-07-08 | 0.374 |
| 2007-07-09 | 0.375 |
| 2007-07-10 | 0.376 |
| 2007-07-11 | 0.376 |
| 2007-07-12 | 0.374 |
| 2007-07-13 | 0.373 |
| 2007-07-14 | 0.373 |
| 2007-07-15 | 0.373 |
| 2007-07-16 | 0.373 |
| 2007-07-17 | 0.371 |
| 2007-07-18 | 0.372 |
| 2007-07-19 | 0.371 |
| 2007-07-20 | 0.371 |
| 2007-07-21 | 0.371 |
| 2007-07-22 | 0.371 |
| 2007-07-23 | 0.371 |
| 2007-07-24 | 0.372 |
| 2007-07-25 | 0.373 |
| 2007-07-26 | 0.376 |
| 2007-07-27 | 0.376 |
| 2007-07-28 | 0.376 |
| 2007-07-29 | 0.376 |
| 2007-07-30 | 0.375 |
| 2007-07-31 | 0.375 |
| 2007-08-01 | 0.374 |
| 2007-08-02 | 0.375 |
| 2007-08-03 | 0.374 |
| 2007-08-04 | 0.374 |
| 2007-08-05 | 0.374 |
| 2007-08-06 | 0.375 |
| 2007-08-07 | 0.375 |
| 2007-08-08 | 0.375 |
| 2007-08-09 | 0.378 |
| 2007-08-10 | 0.381 |
| 2007-08-11 | 0.381 |
| 2007-08-12 | 0.381 |
| 2007-08-13 | 0.381 |
| 2007-08-14 | 0.384 |
| 2007-08-15 | 0.388 |
| 2007-08-16 | 0.396 |
| 2007-08-17 | 0.395 |
| 2007-08-18 | 0.395 |
| 2007-08-19 | 0.395 |
| 2007-08-20 | 0.395 |
| 2007-08-21 | 0.396 |
| 2007-08-22 | 0.395 |
| 2007-08-23 | 0.396 |
| 2007-08-24 | 0.394 |
| 2007-08-25 | 0.394 |
| 2007-08-26 | 0.394 |
| 2007-08-27 | 0.392 |
| 2007-08-28 | 0.395 |
| 2007-08-29 | 0.397 |
| 2007-08-30 | 0.399 |
| 2007-08-31 | 0.394 |
| 2007-09-01 | 0.394 |
| 2007-09-02 | 0.394 |
| 2007-09-03 | 0.391 |
| 2007-09-04 | 0.39 |
| 2007-09-05 | 0.392 |
| 2007-09-06 | 0.392 |
| 2007-09-07 | 0.395 |
| 2007-09-08 | 0.395 |
| 2007-09-09 | 0.395 |
| 2007-09-10 | 0.395 |
| 2007-09-11 | 0.394 |
| 2007-09-12 | 0.392 |
| 2007-09-13 | 0.391 |
| 2007-09-14 | 0.389 |
| 2007-09-15 | 0.389 |
| 2007-09-16 | 0.389 |
| 2007-09-17 | 0.387 |
| 2007-09-18 | 0.385 |
| 2007-09-19 | 0.381 |
| 2007-09-20 | 0.383 |
| 2007-09-21 | 0.381 |
| 2007-09-22 | 0.381 |
| 2007-09-23 | 0.381 |
| 2007-09-24 | 0.384 |
| 2007-09-25 | 0.384 |
| 2007-09-26 | 0.381 |
| 2007-09-27 | 0.381 |
| 2007-09-28 | 0.381 |
| 2007-09-29 | 0.381 |
| 2007-09-30 | 0.381 |
| 2007-10-01 | 0.38 |
| 2007-10-02 | 0.378 |
| 2007-10-03 | 0.379 |
| 2007-10-04 | 0.38 |
| 2007-10-05 | 0.379 |
| 2007-10-06 | 0.379 |
| 2007-10-07 | 0.379 |
| 2007-10-08 | 0.38 |
| 2007-10-09 | 0.382 |
| 2007-10-10 | 0.381 |
| 2007-10-11 | 0.381 |
| 2007-10-12 | 0.382 |
| 2007-10-13 | 0.382 |
| 2007-10-14 | 0.382 |
| 2007-10-15 | 0.382 |
| 2007-10-16 | 0.381 |
| 2007-10-17 | 0.382 |
| 2007-10-18 | 0.383 |
| 2007-10-19 | 0.383 |
| 2007-10-20 | 0.383 |
| 2007-10-21 | 0.383 |
| 2007-10-22 | 0.383 |
| 2007-10-23 | 0.382 |
| 2007-10-24 | 0.383 |
| 2007-10-25 | 0.385 |
| 2007-10-26 | 0.383 |
| 2007-10-27 | 0.383 |
| 2007-10-28 | 0.383 |
| 2007-10-29 | 0.381 |
| 2007-10-30 | 0.38 |
| 2007-10-31 | 0.38 |
| 2007-11-01 | 0.381 |
| 2007-11-02 | 0.381 |
| 2007-11-03 | 0.381 |
| 2007-11-04 | 0.381 |
| 2007-11-05 | 0.381 |
| 2007-11-06 | 0.381 |
| 2007-11-07 | 0.381 |
| 2007-11-08 | 0.381 |
| 2007-11-09 | 0.382 |
| 2007-11-10 | 0.382 |
| 2007-11-11 | 0.382 |
| 2007-11-12 | 0.382 |
| 2007-11-13 | 0.38 |
| 2007-11-14 | 0.379 |
| 2007-11-15 | 0.379 |
| 2007-11-16 | 0.377 |
| 2007-11-17 | 0.377 |
| 2007-11-18 | 0.377 |
| 2007-11-19 | 0.376 |
| 2007-11-20 | 0.376 |
| 2007-11-21 | 0.378 |
| 2007-11-22 | 0.38 |
| 2007-11-23 | 0.38 |
| 2007-11-24 | 0.38 |
| 2007-11-25 | 0.38 |
| 2007-11-26 | 0.382 |
| 2007-11-27 | 0.381 |
| 2007-11-28 | 0.381 |
| 2007-11-29 | 0.381 |
| 2007-11-30 | 0.38 |
| 2007-12-01 | 0.38 |
| 2007-12-02 | 0.38 |
| 2007-12-03 | 0.381 |
| 2007-12-04 | 0.381 |
| 2007-12-05 | 0.38 |
| 2007-12-06 | 0.38 |
| 2007-12-07 | 0.381 |
| 2007-12-08 | 0.381 |
| 2007-12-09 | 0.381 |
| 2007-12-10 | 0.382 |
| 2007-12-11 | 0.382 |
| 2007-12-12 | 0.381 |
| 2007-12-13 | 0.386 |
| 2007-12-14 | 0.385 |
| 2007-12-15 | 0.385 |
| 2007-12-16 | 0.385 |
| 2007-12-17 | 0.386 |
| 2007-12-18 | 0.388 |
| 2007-12-19 | 0.387 |
| 2007-12-20 | 0.388 |
| 2007-12-21 | 0.388 |
| 2007-12-22 | 0.388 |
| 2007-12-23 | 0.388 |
| 2007-12-24 | 0.387 |
| 2007-12-25 | 0.387 |
| 2007-12-26 | 0.385 |
| 2007-12-27 | 0.388 |
| 2007-12-28 | 0.388 |
| 2007-12-29 | 0.388 |
| 2007-12-30 | 0.388 |
| 2007-12-31 | 0.388 |
| 2008-01-01 | 0.388 |
| 2008-01-02 | 0.387 |
| 2008-01-03 | 0.394 |
| 2008-01-04 | 0.394 |
| 2008-01-05 | 0.394 |
| 2008-01-06 | 0.394 |
| 2008-01-07 | 0.394 |
| 2008-01-08 | 0.393 |
| 2008-01-09 | 0.394 |
| 2008-01-10 | 0.396 |
| 2008-01-11 | 0.395 |
| 2008-01-12 | 0.395 |
| 2008-01-13 | 0.395 |
| 2008-01-14 | 0.395 |
| 2008-01-15 | 0.394 |
| 2008-01-16 | 0.397 |
| 2008-01-17 | 0.398 |
| 2008-01-18 | 0.401 |
| 2008-01-19 | 0.401 |
| 2008-01-20 | 0.401 |
| 2008-01-21 | 0.413 |
| 2008-01-22 | 0.418 |
| 2008-01-23 | 0.419 |
| 2008-01-24 | 0.412 |
| 2008-01-25 | 0.409 |
| 2008-01-26 | 0.409 |
| 2008-01-27 | 0.409 |
| 2008-01-28 | 0.415 |
| 2008-01-29 | 0.412 |
| 2008-01-30 | 0.412 |
| 2008-01-31 | 0.413 |
| 2008-02-01 | 0.411 |
| 2008-02-02 | 0.411 |
| 2008-02-03 | 0.411 |
| 2008-02-04 | 0.414 |
| 2008-02-05 | 0.418 |
| 2008-02-06 | 0.42 |
| 2008-02-07 | 0.421 |
| 2008-02-08 | 0.419 |
| 2008-02-09 | 0.419 |
| 2008-02-10 | 0.419 |
| 2008-02-11 | 0.418 |
| 2008-02-12 | 0.416 |
| 2008-02-13 | 0.417 |
| 2008-02-14 | 0.417 |
| 2008-02-15 | 0.418 |
| 2008-02-16 | 0.418 |
| 2008-02-17 | 0.418 |
| 2008-02-18 | 0.417 |
| 2008-02-19 | 0.417 |
| 2008-02-20 | 0.419 |
| 2008-02-21 | 0.42 |
| 2008-02-22 | 0.42 |
| 2008-02-23 | 0.42 |
| 2008-02-24 | 0.42 |
| 2008-02-25 | 0.423 |
| 2008-02-26 | 0.422 |
| 2008-02-27 | 0.422 |
| 2008-02-28 | 0.422 |
| 2008-02-29 | 0.424 |
| 2008-03-01 | 0.424 |
| 2008-03-02 | 0.424 |
| 2008-03-03 | 0.432 |
| 2008-03-04 | 0.434 |
| 2008-03-05 | 0.435 |
| 2008-03-06 | 0.437 |
| 2008-03-07 | 0.434 |
| 2008-03-08 | 0.434 |
| 2008-03-09 | 0.434 |
| 2008-03-10 | 0.429 |
| 2008-03-11 | 0.429 |
| 2008-03-12 | 0.431 |
| 2008-03-13 | 0.432 |
| 2008-03-14 | 0.43 |
| 2008-03-15 | 0.43 |
| 2008-03-16 | 0.43 |
| 2008-03-17 | 0.433 |
| 2008-03-18 | 0.431 |
| 2008-03-19 | 0.43 |
| 2008-03-20 | 0.43 |
| 2008-03-21 | 0.43 |
| 2008-03-22 | 0.43 |
| 2008-03-23 | 0.43 |
| 2008-03-24 | 0.43 |
| 2008-03-25 | 0.43 |
| 2008-03-26 | 0.43 |
| 2008-03-27 | 0.429 |
| 2008-03-28 | 0.43 |
| 2008-03-29 | 0.43 |
| 2008-03-30 | 0.43 |
| 2008-03-31 | 0.43 |
| 2008-04-01 | 0.427 |
| 2008-04-02 | 0.425 |
| 2008-04-03 | 0.426 |
| 2008-04-04 | 0.424 |
| 2008-04-05 | 0.424 |
| 2008-04-06 | 0.424 |
| 2008-04-07 | 0.423 |
| 2008-04-08 | 0.422 |
| 2008-04-09 | 0.421 |
| 2008-04-10 | 0.42 |
| 2008-04-11 | 0.421 |
| 2008-04-12 | 0.421 |
| 2008-04-13 | 0.421 |
| 2008-04-14 | 0.42 |
| 2008-04-15 | 0.418 |
| 2008-04-16 | 0.417 |
| 2008-04-17 | 0.418 |
| 2008-04-18 | 0.417 |
| 2008-04-19 | 0.417 |
| 2008-04-20 | 0.417 |
| 2008-04-21 | 0.417 |
| 2008-04-22 | 0.418 |
| 2008-04-23 | 0.417 |
| 2008-04-24 | 0.416 |
| 2008-04-25 | 0.415 |
| 2008-04-26 | 0.415 |
| 2008-04-27 | 0.415 |
| 2008-04-28 | 0.414 |
| 2008-04-29 | 0.413 |
| 2008-04-30 | 0.41 |
| 2008-05-01 | 0.41 |
| 2008-05-02 | 0.411 |
| 2008-05-03 | 0.411 |
| 2008-05-04 | 0.411 |
| 2008-05-05 | 0.411 |
| 2008-05-06 | 0.411 |
| 2008-05-07 | 0.412 |
| 2008-05-08 | 0.414 |
| 2008-05-09 | 0.415 |
| 2008-05-10 | 0.415 |
| 2008-05-11 | 0.415 |
| 2008-05-12 | 0.418 |
| 2008-05-13 | 0.418 |
| 2008-05-14 | 0.418 |
| 2008-05-15 | 0.421 |
| 2008-05-16 | 0.421 |
| 2008-05-17 | 0.421 |
| 2008-05-18 | 0.421 |
| 2008-05-19 | 0.421 |
| 2008-05-20 | 0.422 |
| 2008-05-21 | 0.423 |
| 2008-05-22 | 0.424 |
| 2008-05-23 | 0.423 |
| 2008-05-24 | 0.423 |
| 2008-05-25 | 0.423 |
| 2008-05-26 | 0.423 |
| 2008-05-27 | 0.423 |
| 2008-05-28 | 0.423 |
| 2008-05-29 | 0.425 |
| 2008-05-30 | 0.427 |
| 2008-05-31 | 0.427 |
| 2008-06-01 | 0.427 |
| 2008-06-02 | 0.427 |
| 2008-06-03 | 0.436 |
| 2008-06-04 | 0.438 |
| 2008-06-05 | 0.439 |
| 2008-06-06 | 0.441 |
| 2008-06-07 | 0.441 |
| 2008-06-08 | 0.441 |
| 2008-06-09 | 0.436 |
| 2008-06-10 | 0.437 |
| 2008-06-11 | 0.444 |
| 2008-06-12 | 0.444 |
| 2008-06-13 | 0.442 |
| 2008-06-14 | 0.442 |
| 2008-06-15 | 0.442 |
| 2008-06-16 | 0.443 |
| 2008-06-17 | 0.442 |
| 2008-06-18 | 0.445 |
| 2008-06-19 | 0.447 |
| 2008-06-20 | 0.445 |
| 2008-06-21 | 0.445 |
| 2008-06-22 | 0.445 |
| 2008-06-23 | 0.441 |
| 2008-06-24 | 0.44 |
| 2008-06-25 | 0.443 |
| 2008-06-26 | 0.451 |
| 2008-06-27 | 0.456 |
| 2008-06-28 | 0.456 |
| 2008-06-29 | 0.456 |
| 2008-06-30 | 0.456 |
| 2008-07-01 | 0.464 |
| 2008-07-02 | 0.467 |
| 2008-07-03 | 0.461 |
| 2008-07-04 | 0.459 |
| 2008-07-05 | 0.459 |
| 2008-07-06 | 0.459 |
| 2008-07-07 | 0.46 |
| 2008-07-08 | 0.462 |
| 2008-07-09 | 0.465 |
| 2008-07-10 | 0.469 |
| 2008-07-11 | 0.468 |
| 2008-07-12 | 0.468 |
| 2008-07-13 | 0.468 |
| 2008-07-14 | 0.467 |
| 2008-07-15 | 0.468 |
| 2008-07-16 | 0.465 |
| 2008-07-17 | 0.463 |
| 2008-07-18 | 0.462 |
| 2008-07-19 | 0.462 |
| 2008-07-20 | 0.462 |
| 2008-07-21 | 0.461 |
| 2008-07-22 | 0.462 |
| 2008-07-23 | 0.466 |
| 2008-07-24 | 0.463 |
| 2008-07-25 | 0.461 |
| 2008-07-26 | 0.461 |
| 2008-07-27 | 0.461 |
| 2008-07-28 | 0.462 |
| 2008-07-29 | 0.46 |
| 2008-07-30 | 0.456 |
| 2008-07-31 | 0.454 |
| 2008-08-01 | 0.452 |
| 2008-08-02 | 0.452 |
| 2008-08-03 | 0.452 |
| 2008-08-04 | 0.451 |
| 2008-08-05 | 0.44 |
| 2008-08-06 | 0.444 |
| 2008-08-07 | 0.444 |
| 2008-08-08 | 0.441 |
| 2008-08-09 | 0.441 |
| 2008-08-10 | 0.441 |
| 2008-08-11 | 0.441 |
| 2008-08-12 | 0.442 |
| 2008-08-13 | 0.439 |
| 2008-08-14 | 0.438 |
| 2008-08-15 | 0.436 |
| 2008-08-16 | 0.436 |
| 2008-08-17 | 0.436 |
| 2008-08-18 | 0.436 |
| 2008-08-19 | 0.432 |
| 2008-08-20 | 0.432 |
| 2008-08-21 | 0.43 |
| 2008-08-22 | 0.428 |
| 2008-08-23 | 0.428 |
| 2008-08-24 | 0.428 |
| 2008-08-25 | 0.427 |
| 2008-08-26 | 0.426 |
| 2008-08-27 | 0.42 |
| 2008-08-28 | 0.418 |
| 2008-08-29 | 0.417 |
| 2008-08-30 | 0.417 |
| 2008-08-31 | 0.417 |
| 2008-09-01 | 0.415 |
| 2008-09-02 | 0.422 |
| 2008-09-03 | 0.424 |
| 2008-09-04 | 0.422 |
| 2008-09-05 | 0.423 |
| 2008-09-06 | 0.423 |
| 2008-09-07 | 0.423 |
| 2008-09-08 | 0.423 |
| 2008-09-09 | 0.424 |
| 2008-09-10 | 0.423 |
| 2008-09-11 | 0.425 |
| 2008-09-12 | 0.423 |
| 2008-09-13 | 0.423 |
| 2008-09-14 | 0.423 |
| 2008-09-15 | 0.425 |
| 2008-09-16 | 0.429 |
| 2008-09-17 | 0.432 |
| 2008-09-18 | 0.448 |
| 2008-09-19 | 0.435 |
| 2008-09-20 | 0.435 |
| 2008-09-21 | 0.435 |
| 2008-09-22 | 0.433 |
| 2008-09-23 | 0.437 |
| 2008-09-24 | 0.437 |
| 2008-09-25 | 0.434 |
| 2008-09-26 | 0.434 |
| 2008-09-27 | 0.434 |
| 2008-09-28 | 0.434 |
| 2008-09-29 | 0.434 |
| 2008-09-30 | 0.434 |
| 2008-10-01 | 0.431 |
| 2008-10-02 | 0.428 |
| 2008-10-03 | 0.425 |
| 2008-10-04 | 0.425 |
| 2008-10-05 | 0.425 |
| 2008-10-06 | 0.432 |
| 2008-10-07 | 0.434 |
| 2008-10-08 | 0.439 |
| 2008-10-09 | 0.441 |
| 2008-10-10 | 0.453 |
| 2008-10-11 | 0.453 |
| 2008-10-12 | 0.453 |
| 2008-10-13 | 0.453 |
| 2008-10-14 | 0.447 |
| 2008-10-15 | 0.455 |
| 2008-10-16 | 0.461 |
| 2008-10-17 | 0.451 |
| 2008-10-18 | 0.451 |
| 2008-10-19 | 0.451 |
| 2008-10-20 | 0.449 |
| 2008-10-21 | 0.447 |
| 2008-10-22 | 0.453 |
| 2008-10-23 | 0.463 |
| 2008-10-24 | 0.467 |
| 2008-10-25 | 0.467 |
| 2008-10-26 | 0.467 |
| 2008-10-27 | 0.46 |
| 2008-10-28 | 0.465 |
| 2008-10-29 | 0.459 |
| 2008-10-30 | 0.457 |
| 2008-10-31 | 0.459 |
| 2008-11-01 | 0.459 |
| 2008-11-02 | 0.459 |
| 2008-11-03 | 0.459 |
| 2008-11-04 | 0.457 |
| 2008-11-05 | 0.449 |
| 2008-11-06 | 0.453 |
| 2008-11-07 | 0.449 |
| 2008-11-08 | 0.449 |
| 2008-11-09 | 0.449 |
| 2008-11-10 | 0.445 |
| 2008-11-11 | 0.446 |
| 2008-11-12 | 0.444 |
| 2008-11-13 | 0.448 |
| 2008-11-14 | 0.442 |
| 2008-11-15 | 0.442 |
| 2008-11-16 | 0.442 |
| 2008-11-17 | 0.442 |
| 2008-11-18 | 0.443 |
| 2008-11-19 | 0.443 |
| 2008-11-20 | 0.448 |
| 2008-11-21 | 0.447 |
| 2008-11-22 | 0.447 |
| 2008-11-23 | 0.447 |
| 2008-11-24 | 0.441 |
| 2008-11-25 | 0.436 |
| 2008-11-26 | 0.433 |
| 2008-11-27 | 0.433 |
| 2008-11-28 | 0.43 |
| 2008-11-29 | 0.43 |
| 2008-11-30 | 0.43 |
| 2008-12-01 | 0.428 |
| 2008-12-02 | 0.428 |
| 2008-12-03 | 0.422 |
| 2008-12-04 | 0.422 |
| 2008-12-05 | 0.422 |
| 2008-12-06 | 0.422 |
| 2008-12-07 | 0.422 |
| 2008-12-08 | 0.422 |
| 2008-12-09 | 0.419 |
| 2008-12-10 | 0.417 |
| 2008-12-11 | 0.412 |
| 2008-12-12 | 0.409 |
| 2008-12-13 | 0.409 |
| 2008-12-14 | 0.409 |
| 2008-12-15 | 0.404 |
| 2008-12-16 | 0.403 |
| 2008-12-17 | 0.399 |
| 2008-12-18 | 0.399 |
| 2008-12-19 | 0.396 |
| 2008-12-20 | 0.396 |
| 2008-12-21 | 0.396 |
| 2008-12-22 | 0.384 |
| 2008-12-23 | 0.385 |
| 2008-12-24 | 0.386 |
| 2008-12-25 | 0.386 |
| 2008-12-26 | 0.385 |
| 2008-12-27 | 0.385 |
| 2008-12-28 | 0.385 |
| 2008-12-29 | 0.385 |
| 2008-12-30 | 0.385 |
| 2008-12-31 | 0.385 |
| 2009-01-01 | 0.385 |
| 2009-01-02 | 0.387 |
| 2009-01-03 | 0.387 |
| 2009-01-04 | 0.387 |
| 2009-01-05 | 0.385 |
| 2009-01-06 | 0.38 |
| 2009-01-07 | 0.378 |
| 2009-01-08 | 0.377 |
| 2009-01-09 | 0.374 |
| 2009-01-10 | 0.374 |
| 2009-01-11 | 0.374 |
| 2009-01-12 | 0.374 |
| 2009-01-13 | 0.376 |
| 2009-01-14 | 0.368 |
| 2009-01-15 | 0.373 |
| 2009-01-16 | 0.372 |
| 2009-01-17 | 0.372 |
| 2009-01-18 | 0.372 |
| 2009-01-19 | 0.376 |
| 2009-01-20 | 0.374 |
| 2009-01-21 | 0.373 |
| 2009-01-22 | 0.365 |
| 2009-01-23 | 0.366 |
| 2009-01-24 | 0.366 |
| 2009-01-25 | 0.366 |
| 2009-01-26 | 0.365 |
| 2009-01-27 | 0.364 |
| 2009-01-28 | 0.363 |
| 2009-01-29 | 0.364 |
| 2009-01-30 | 0.359 |
| 2009-01-31 | 0.359 |
| 2009-02-01 | 0.359 |
| 2009-02-02 | 0.358 |
| 2009-02-03 | 0.36 |
| 2009-02-04 | 0.359 |
| 2009-02-05 | 0.358 |
| 2009-02-06 | 0.355 |
| 2009-02-07 | 0.355 |
| 2009-02-08 | 0.355 |
| 2009-02-09 | 0.359 |
| 2009-02-10 | 0.36 |
| 2009-02-11 | 0.367 |
| 2009-02-12 | 0.366 |
| 2009-02-13 | 0.362 |
| 2009-02-14 | 0.362 |
| 2009-02-15 | 0.362 |
| 2009-02-16 | 0.36 |
| 2009-02-17 | 0.362 |
| 2009-02-18 | 0.36 |
| 2009-02-19 | 0.36 |
| 2009-02-20 | 0.36 |
| 2009-02-21 | 0.36 |
| 2009-02-22 | 0.36 |
| 2009-02-23 | 0.357 |
| 2009-02-24 | 0.358 |
| 2009-02-25 | 0.357 |
| 2009-02-26 | 0.354 |
| 2009-02-27 | 0.353 |
| 2009-02-28 | 0.353 |
| 2009-03-01 | 0.353 |
| 2009-03-02 | 0.343 |
| 2009-03-03 | 0.341 |
| 2009-03-04 | 0.335 |
| 2009-03-05 | 0.338 |
| 2009-03-06 | 0.339 |
| 2009-03-07 | 0.339 |
| 2009-03-08 | 0.339 |
| 2009-03-09 | 0.34 |
| 2009-03-10 | 0.337 |
| 2009-03-11 | 0.34 |
| 2009-03-12 | 0.339 |
| 2009-03-13 | 0.334 |
| 2009-03-14 | 0.334 |
| 2009-03-15 | 0.334 |
| 2009-03-16 | 0.33 |
| 2009-03-17 | 0.327 |
| 2009-03-18 | 0.33 |
| 2009-03-19 | 0.324 |
| 2009-03-20 | 0.319 |
| 2009-03-21 | 0.319 |
| 2009-03-22 | 0.319 |
| 2009-03-23 | 0.319 |
| 2009-03-24 | 0.317 |
| 2009-03-25 | 0.322 |
| 2009-03-26 | 0.324 |
| 2009-03-27 | 0.324 |
| 2009-03-28 | 0.324 |
| 2009-03-29 | 0.324 |
| 2009-03-30 | 0.328 |
| 2009-03-31 | 0.323 |
| 2009-04-01 | 0.321 |
| 2009-04-02 | 0.32 |
| 2009-04-03 | 0.319 |
| 2009-04-04 | 0.319 |
| 2009-04-05 | 0.319 |
| 2009-04-06 | 0.313 |
| 2009-04-07 | 0.315 |
| 2009-04-08 | 0.309 |
| 2009-04-09 | 0.309 |
| 2009-04-10 | 0.309 |
| 2009-04-11 | 0.309 |
| 2009-04-12 | 0.309 |
| 2009-04-13 | 0.311 |
| 2009-04-14 | 0.309 |
| 2009-04-15 | 0.307 |
| 2009-04-16 | 0.307 |
| 2009-04-17 | 0.308 |
| 2009-04-18 | 0.308 |
| 2009-04-19 | 0.308 |
| 2009-04-20 | 0.307 |
| 2009-04-21 | 0.302 |
| 2009-04-22 | 0.297 |
| 2009-04-23 | 0.297 |
| 2009-04-24 | 0.295 |
| 2009-04-25 | 0.295 |
| 2009-04-26 | 0.295 |
| 2009-04-27 | 0.297 |
| 2009-04-28 | 0.297 |
| 2009-04-29 | 0.294 |
| 2009-04-30 | 0.292 |
| 2009-05-01 | 0.292 |
| 2009-05-02 | 0.292 |
| 2009-05-03 | 0.292 |
| 2009-05-04 | 0.29 |
| 2009-05-05 | 0.292 |
| 2009-05-06 | 0.29 |
| 2009-05-07 | 0.291 |
| 2009-05-08 | 0.288 |
| 2009-05-09 | 0.288 |
| 2009-05-10 | 0.288 |
| 2009-05-11 | 0.289 |
| 2009-05-12 | 0.286 |
| 2009-05-13 | 0.286 |
| 2009-05-14 | 0.279 |
| 2009-05-15 | 0.278 |
| 2009-05-16 | 0.278 |
| 2009-05-17 | 0.278 |
| 2009-05-18 | 0.275 |
| 2009-05-19 | 0.27 |
| 2009-05-20 | 0.268 |
| 2009-05-21 | 0.278 |
| 2009-05-22 | 0.286 |
| 2009-05-23 | 0.286 |
| 2009-05-24 | 0.286 |
| 2009-05-25 | 0.286 |
| 2009-05-26 | 0.292 |
| 2009-05-27 | 0.285 |
| 2009-05-28 | 0.291 |
| 2009-05-29 | 0.286 |
| 2009-05-30 | 0.286 |
| 2009-05-31 | 0.286 |
| 2009-06-01 | 0.286 |
| 2009-06-02 | 0.296 |
| 2009-06-03 | 0.295 |
| 2009-06-04 | 0.296 |
| 2009-06-05 | 0.303 |
| 2009-06-06 | 0.303 |
| 2009-06-07 | 0.303 |
| 2009-06-08 | 0.307 |
| 2009-06-09 | 0.306 |
| 2009-06-10 | 0.307 |
| 2009-06-11 | 0.305 |
| 2009-06-12 | 0.3 |
| 2009-06-13 | 0.3 |
| 2009-06-14 | 0.3 |
| 2009-06-15 | 0.3 |
| 2009-06-16 | 0.308 |
| 2009-06-17 | 0.305 |
| 2009-06-18 | 0.304 |
| 2009-06-19 | 0.302 |
| 2009-06-20 | 0.302 |
| 2009-06-21 | 0.302 |
| 2009-06-22 | 0.302 |
| 2009-06-23 | 0.306 |
| 2009-06-24 | 0.304 |
| 2009-06-25 | 0.302 |
| 2009-06-26 | 0.295 |
| 2009-06-27 | 0.295 |
| 2009-06-28 | 0.295 |
| 2009-06-29 | 0.295 |
| 2009-06-30 | 0.293 |
| 2009-07-01 | 0.29 |
| 2009-07-02 | 0.292 |
| 2009-07-03 | 0.287 |
| 2009-07-04 | 0.287 |
| 2009-07-05 | 0.287 |
| 2009-07-06 | 0.283 |
| 2009-07-07 | 0.281 |
| 2009-07-08 | 0.284 |
| 2009-07-09 | 0.285 |
| 2009-07-10 | 0.283 |
| 2009-07-11 | 0.283 |
| 2009-07-12 | 0.283 |
| 2009-07-13 | 0.281 |
| 2009-07-14 | 0.281 |
| 2009-07-15 | 0.28 |
| 2009-07-16 | 0.279 |
| 2009-07-17 | 0.276 |
| 2009-07-18 | 0.276 |
| 2009-07-19 | 0.276 |
| 2009-07-20 | 0.276 |
| 2009-07-21 | 0.273 |
| 2009-07-22 | 0.272 |
| 2009-07-23 | 0.274 |
| 2009-07-24 | 0.269 |
| 2009-07-25 | 0.269 |
| 2009-07-26 | 0.269 |
| 2009-07-27 | 0.268 |
| 2009-07-28 | 0.275 |
| 2009-07-29 | 0.276 |
| 2009-07-30 | 0.277 |
| 2009-07-31 | 0.273 |
| 2009-08-01 | 0.273 |
| 2009-08-02 | 0.273 |
| 2009-08-03 | 0.271 |
| 2009-08-04 | 0.272 |
| 2009-08-05 | 0.276 |
| 2009-08-06 | 0.279 |
| 2009-08-07 | 0.279 |
| 2009-08-08 | 0.279 |
| 2009-08-09 | 0.279 |
| 2009-08-10 | 0.278 |
| 2009-08-11 | 0.278 |
| 2009-08-12 | 0.278 |
| 2009-08-13 | 0.281 |
| 2009-08-14 | 0.278 |
| 2009-08-15 | 0.278 |
| 2009-08-16 | 0.278 |
| 2009-08-17 | 0.278 |
| 2009-08-18 | 0.282 |
| 2009-08-19 | 0.286 |
| 2009-08-20 | 0.287 |
| 2009-08-21 | 0.288 |
| 2009-08-22 | 0.288 |
| 2009-08-23 | 0.288 |
| 2009-08-24 | 0.285 |
| 2009-08-25 | 0.287 |
| 2009-08-26 | 0.286 |
| 2009-08-27 | 0.289 |
| 2009-08-28 | 0.286 |
| 2009-08-29 | 0.286 |
| 2009-08-30 | 0.286 |
| 2009-08-31 | 0.284 |
| 2009-09-01 | 0.286 |
| 2009-09-02 | 0.286 |
| 2009-09-03 | 0.287 |
| 2009-09-04 | 0.286 |
| 2009-09-05 | 0.286 |
| 2009-09-06 | 0.286 |
| 2009-09-07 | 0.284 |
| 2009-09-08 | 0.288 |
| 2009-09-09 | 0.287 |
| 2009-09-10 | 0.293 |
| 2009-09-11 | 0.29 |
| 2009-09-12 | 0.29 |
| 2009-09-13 | 0.29 |
| 2009-09-14 | 0.293 |
| 2009-09-15 | 0.291 |
| 2009-09-16 | 0.292 |
| 2009-09-17 | 0.293 |
| 2009-09-18 | 0.288 |
| 2009-09-19 | 0.288 |
| 2009-09-20 | 0.288 |
| 2009-09-21 | 0.29 |
| 2009-09-22 | 0.287 |
| 2009-09-23 | 0.289 |
| 2009-09-24 | 0.289 |
| 2009-09-25 | 0.288 |
| 2009-09-26 | 0.288 |
| 2009-09-27 | 0.288 |
| 2009-09-28 | 0.282 |
| 2009-09-29 | 0.284 |
| 2009-09-30 | 0.278 |
| 2009-10-01 | 0.278 |
| 2009-10-02 | 0.274 |
| 2009-10-03 | 0.274 |
| 2009-10-04 | 0.274 |
| 2009-10-05 | 0.276 |
| 2009-10-06 | 0.273 |
| 2009-10-07 | 0.268 |
| 2009-10-08 | 0.274 |
| 2009-10-09 | 0.271 |
| 2009-10-10 | 0.271 |
| 2009-10-11 | 0.271 |
| 2009-10-12 | 0.271 |
| 2009-10-13 | 0.271 |
| 2009-10-14 | 0.272 |
| 2009-10-15 | 0.271 |
| 2009-10-16 | 0.27 |
| 2009-10-17 | 0.27 |
| 2009-10-18 | 0.27 |
| 2009-10-19 | 0.265 |
| 2009-10-20 | 0.268 |
| 2009-10-21 | 0.271 |
| 2009-10-22 | 0.269 |
| 2009-10-23 | 0.267 |
| 2009-10-24 | 0.267 |
| 2009-10-25 | 0.267 |
| 2009-10-26 | 0.263 |
| 2009-10-27 | 0.261 |
| 2009-10-28 | 0.263 |
| 2009-10-29 | 0.261 |
| 2009-10-30 | 0.26 |
| 2009-10-31 | 0.26 |
| 2009-11-01 | 0.26 |
| 2009-11-02 | 0.26 |
| 2009-11-03 | 0.256 |
| 2009-11-04 | 0.254 |
| 2009-11-05 | 0.254 |
| 2009-11-06 | 0.249 |
| 2009-11-07 | 0.249 |
| 2009-11-08 | 0.249 |
| 2009-11-09 | 0.246 |
| 2009-11-10 | 0.245 |
| 2009-11-11 | 0.243 |
| 2009-11-12 | 0.241 |
| 2009-11-13 | 0.236 |
| 2009-11-14 | 0.236 |
| 2009-11-15 | 0.236 |
| 2009-11-16 | 0.236 |
| 2009-11-17 | 0.238 |
| 2009-11-18 | 0.243 |
| 2009-11-19 | 0.243 |
| 2009-11-20 | 0.237 |
| 2009-11-21 | 0.237 |
| 2009-11-22 | 0.237 |
| 2009-11-23 | 0.232 |
| 2009-11-24 | 0.229 |
| 2009-11-25 | 0.224 |
| 2009-11-26 | 0.224 |
| 2009-11-27 | 0.224 |
| 2009-11-28 | 0.224 |
| 2009-11-29 | 0.224 |
| 2009-11-30 | 0.225 |
| 2009-12-01 | 0.223 |
| 2009-12-02 | 0.226 |
| 2009-12-03 | 0.232 |
| 2009-12-04 | 0.238 |
| 2009-12-05 | 0.238 |
| 2009-12-06 | 0.238 |
| 2009-12-07 | 0.239 |
| 2009-12-08 | 0.239 |
| 2009-12-09 | 0.237 |
| 2009-12-10 | 0.237 |
| 2009-12-11 | 0.239 |
| 2009-12-12 | 0.239 |
| 2009-12-13 | 0.239 |
| 2009-12-14 | 0.236 |
| 2009-12-15 | 0.24 |
| 2009-12-16 | 0.238 |
| 2009-12-17 | 0.241 |
| 2009-12-18 | 0.239 |
| 2009-12-19 | 0.239 |
| 2009-12-20 | 0.239 |
| 2009-12-21 | 0.245 |
| 2009-12-22 | 0.245 |
| 2009-12-23 | 0.243 |
| 2009-12-24 | 0.242 |
| 2009-12-25 | 0.242 |
| 2009-12-26 | 0.242 |
| 2009-12-27 | 0.242 |
| 2009-12-28 | 0.244 |
| 2009-12-29 | 0.244 |
| 2009-12-30 | 0.24 |
| 2009-12-31 | 0.24 |
| 2010-01-01 | 0.24 |
| 2010-01-02 | 0.24 |
| 2010-01-03 | 0.24 |
| 2010-01-04 | 0.248 |
| 2010-01-05 | 0.246 |
| 2010-01-06 | 0.246 |
| 2010-01-07 | 0.257 |
| 2010-01-08 | 0.258 |
| 2010-01-09 | 0.258 |
| 2010-01-10 | 0.258 |
| 2010-01-11 | 0.258 |
| 2010-01-12 | 0.26 |
| 2010-01-13 | 0.265 |
| 2010-01-14 | 0.271 |
| 2010-01-15 | 0.273 |
| 2010-01-16 | 0.273 |
| 2010-01-17 | 0.273 |
| 2010-01-18 | 0.268 |
| 2010-01-19 | 0.267 |
| 2010-01-20 | 0.269 |
| 2010-01-21 | 0.27 |
| 2010-01-22 | 0.267 |
| 2010-01-23 | 0.267 |
| 2010-01-24 | 0.267 |
| 2010-01-25 | 0.267 |
| 2010-01-26 | 0.266 |
| 2010-01-27 | 0.269 |
| 2010-01-28 | 0.273 |
| 2010-01-29 | 0.272 |
| 2010-01-30 | 0.272 |
| 2010-01-31 | 0.272 |
| 2010-02-01 | 0.275 |
| 2010-02-02 | 0.279 |
| 2010-02-03 | 0.277 |
| 2010-02-04 | 0.279 |
| 2010-02-05 | 0.28 |
| 2010-02-06 | 0.28 |
| 2010-02-07 | 0.28 |
| 2010-02-08 | 0.277 |
| 2010-02-09 | 0.273 |
| 2010-02-10 | 0.273 |
| 2010-02-11 | 0.27 |
| 2010-02-12 | 0.272 |
| 2010-02-13 | 0.272 |
| 2010-02-14 | 0.272 |
| 2010-02-15 | 0.272 |
| 2010-02-16 | 0.277 |
| 2010-02-17 | 0.276 |
| 2010-02-18 | 0.277 |
| 2010-02-19 | 0.277 |
| 2010-02-20 | 0.277 |
| 2010-02-21 | 0.277 |
| 2010-02-22 | 0.278 |
| 2010-02-23 | 0.279 |
| 2010-02-24 | 0.278 |
| 2010-02-25 | 0.276 |
| 2010-02-26 | 0.276 |
| 2010-02-27 | 0.276 |
| 2010-02-28 | 0.276 |
| 2010-03-01 | 0.273 |
| 2010-03-02 | 0.274 |
| 2010-03-03 | 0.277 |
| 2010-03-04 | 0.275 |
| 2010-03-05 | 0.272 |
| 2010-03-06 | 0.272 |
| 2010-03-07 | 0.272 |
| 2010-03-08 | 0.272 |
| 2010-03-09 | 0.273 |
| 2010-03-10 | 0.272 |
| 2010-03-11 | 0.273 |
| 2010-03-12 | 0.271 |
| 2010-03-13 | 0.271 |
| 2010-03-14 | 0.271 |
| 2010-03-15 | 0.271 |
| 2010-03-16 | 0.27 |
| 2010-03-17 | 0.27 |
| 2010-03-18 | 0.272 |
| 2010-03-19 | 0.274 |
| 2010-03-20 | 0.274 |
| 2010-03-21 | 0.274 |
| 2010-03-22 | 0.274 |
| 2010-03-23 | 0.272 |
| 2010-03-24 | 0.27 |
| 2010-03-25 | 0.273 |
| 2010-03-26 | 0.273 |
| 2010-03-27 | 0.273 |
| 2010-03-28 | 0.273 |
| 2010-03-29 | 0.271 |
| 2010-03-30 | 0.272 |
| 2010-03-31 | 0.274 |
| 2010-04-01 | 0.274 |
| 2010-04-02 | 0.274 |
| 2010-04-03 | 0.274 |
| 2010-04-04 | 0.274 |
| 2010-04-05 | 0.272 |
| 2010-04-06 | 0.267 |
| 2010-04-07 | 0.263 |
| 2010-04-08 | 0.266 |
| 2010-04-09 | 0.262 |
| 2010-04-10 | 0.262 |
| 2010-04-11 | 0.262 |
| 2010-04-12 | 0.262 |
| 2010-04-13 | 0.264 |
| 2010-04-14 | 0.263 |
| 2010-04-15 | 0.263 |
| 2010-04-16 | 0.263 |
| 2010-04-17 | 0.263 |
| 2010-04-18 | 0.263 |
| 2010-04-19 | 0.261 |
| 2010-04-20 | 0.258 |
| 2010-04-21 | 0.259 |
| 2010-04-22 | 0.261 |
| 2010-04-23 | 0.262 |
| 2010-04-24 | 0.262 |
| 2010-04-25 | 0.262 |
| 2010-04-26 | 0.26 |
| 2010-04-27 | 0.262 |
| 2010-04-28 | 0.263 |
| 2010-04-29 | 0.262 |
| 2010-04-30 | 0.263 |
| 2010-05-01 | 0.263 |
| 2010-05-02 | 0.263 |
| 2010-05-03 | 0.25 |
| 2010-05-04 | 0.249 |
| 2010-05-05 | 0.248 |
| 2010-05-06 | 0.25 |
| 2010-05-07 | 0.254 |
| 2010-05-08 | 0.254 |
| 2010-05-09 | 0.254 |
| 2010-05-10 | 0.249 |
| 2010-05-11 | 0.25 |
| 2010-05-12 | 0.245 |
| 2010-05-13 | 0.249 |
| 2010-05-14 | 0.25 |
| 2010-05-15 | 0.25 |
| 2010-05-16 | 0.25 |
| 2010-05-17 | 0.25 |
| 2010-05-18 | 0.25 |
| 2010-05-19 | 0.255 |
| 2010-05-20 | 0.254 |
| 2010-05-21 | 0.249 |
| 2010-05-22 | 0.249 |
| 2010-05-23 | 0.249 |
| 2010-05-24 | 0.247 |
| 2010-05-25 | 0.25 |
| 2010-05-26 | 0.25 |
| 2010-05-27 | 0.246 |
| 2010-05-28 | 0.244 |
| 2010-05-29 | 0.244 |
| 2010-05-30 | 0.244 |
| 2010-05-31 | 0.248 |
| 2010-06-01 | 0.248 |
| 2010-06-02 | 0.247 |
| 2010-06-03 | 0.246 |
| 2010-06-04 | 0.245 |
| 2010-06-05 | 0.245 |
| 2010-06-06 | 0.245 |
| 2010-06-07 | 0.245 |
| 2010-06-08 | 0.242 |
| 2010-06-09 | 0.241 |
| 2010-06-10 | 0.242 |
| 2010-06-11 | 0.243 |
| 2010-06-12 | 0.243 |
| 2010-06-13 | 0.243 |
| 2010-06-14 | 0.243 |
| 2010-06-15 | 0.24 |
| 2010-06-16 | 0.242 |
| 2010-06-17 | 0.247 |
| 2010-06-18 | 0.243 |
| 2010-06-19 | 0.243 |
| 2010-06-20 | 0.243 |
| 2010-06-21 | 0.243 |
| 2010-06-22 | 0.245 |
| 2010-06-23 | 0.243 |
| 2010-06-24 | 0.244 |
| 2010-06-25 | 0.239 |
| 2010-06-26 | 0.239 |
| 2010-06-27 | 0.239 |
| 2010-06-28 | 0.239 |
| 2010-06-29 | 0.241 |
| 2010-06-30 | 0.241 |
| 2010-07-01 | 0.238 |
| 2010-07-02 | 0.238 |
| 2010-07-03 | 0.238 |
| 2010-07-04 | 0.238 |
| 2010-07-05 | 0.238 |
| 2010-07-06 | 0.238 |
| 2010-07-07 | 0.236 |
| 2010-07-08 | 0.236 |
| 2010-07-09 | 0.236 |
| 2010-07-10 | 0.236 |
| 2010-07-11 | 0.236 |
| 2010-07-12 | 0.234 |
| 2010-07-13 | 0.234 |
| 2010-07-14 | 0.234 |
| 2010-07-15 | 0.234 |
| 2010-07-16 | 0.231 |
| 2010-07-17 | 0.231 |
| 2010-07-18 | 0.231 |
| 2010-07-19 | 0.23 |
| 2010-07-20 | 0.23 |
| 2010-07-21 | 0.231 |
| 2010-07-22 | 0.235 |
| 2010-07-23 | 0.236 |
| 2010-07-24 | 0.236 |
| 2010-07-25 | 0.236 |
| 2010-07-26 | 0.236 |
| 2010-07-27 | 0.234 |
| 2010-07-28 | 0.235 |
| 2010-07-29 | 0.235 |
| 2010-07-30 | 0.232 |
| 2010-07-31 | 0.232 |
| 2010-08-01 | 0.232 |
| 2010-08-02 | 0.232 |
| 2010-08-03 | 0.231 |
| 2010-08-04 | 0.229 |
| 2010-08-05 | 0.231 |
| 2010-08-06 | 0.228 |
| 2010-08-07 | 0.228 |
| 2010-08-08 | 0.228 |
| 2010-08-09 | 0.228 |
| 2010-08-10 | 0.227 |
| 2010-08-11 | 0.226 |
| 2010-08-12 | 0.23 |
| 2010-08-13 | 0.23 |
| 2010-08-14 | 0.23 |
| 2010-08-15 | 0.23 |
| 2010-08-16 | 0.23 |
| 2010-08-17 | 0.226 |
| 2010-08-18 | 0.227 |
| 2010-08-19 | 0.226 |
| 2010-08-20 | 0.224 |
| 2010-08-21 | 0.224 |
| 2010-08-22 | 0.224 |
| 2010-08-23 | 0.226 |
| 2010-08-24 | 0.227 |
| 2010-08-25 | 0.226 |
| 2010-08-26 | 0.225 |
| 2010-08-27 | 0.224 |
| 2010-08-28 | 0.224 |
| 2010-08-29 | 0.224 |
| 2010-08-30 | 0.224 |
| 2010-08-31 | 0.222 |
| 2010-09-01 | 0.219 |
| 2010-09-02 | 0.22 |
| 2010-09-03 | 0.22 |
| 2010-09-04 | 0.22 |
| 2010-09-05 | 0.22 |
| 2010-09-06 | 0.221 |
| 2010-09-07 | 0.227 |
| 2010-09-08 | 0.224 |
| 2010-09-09 | 0.228 |
| 2010-09-10 | 0.226 |
| 2010-09-11 | 0.226 |
| 2010-09-12 | 0.226 |
| 2010-09-13 | 0.226 |
| 2010-09-14 | 0.228 |
| 2010-09-15 | 0.224 |
| 2010-09-16 | 0.226 |
| 2010-09-17 | 0.227 |
| 2010-09-18 | 0.227 |
| 2010-09-19 | 0.227 |
| 2010-09-20 | 0.222 |
| 2010-09-21 | 0.223 |
| 2010-09-22 | 0.226 |
| 2010-09-23 | 0.228 |
| 2010-09-24 | 0.227 |
| 2010-09-25 | 0.227 |
| 2010-09-26 | 0.227 |
| 2010-09-27 | 0.227 |
| 2010-09-28 | 0.226 |
| 2010-09-29 | 0.227 |
| 2010-09-30 | 0.229 |
| 2010-10-01 | 0.229 |
| 2010-10-02 | 0.229 |
| 2010-10-03 | 0.229 |
| 2010-10-04 | 0.231 |
| 2010-10-05 | 0.231 |
| 2010-10-06 | 0.226 |
| 2010-10-07 | 0.225 |
| 2010-10-08 | 0.219 |
| 2010-10-09 | 0.219 |
| 2010-10-10 | 0.219 |
| 2010-10-11 | 0.221 |
| 2010-10-12 | 0.221 |
| 2010-10-13 | 0.22 |
| 2010-10-14 | 0.224 |
| 2010-10-15 | 0.223 |
| 2010-10-16 | 0.223 |
| 2010-10-17 | 0.223 |
| 2010-10-18 | 0.223 |
| 2010-10-19 | 0.222 |
| 2010-10-20 | 0.222 |
| 2010-10-21 | 0.222 |
| 2010-10-22 | 0.218 |
| 2010-10-23 | 0.218 |
| 2010-10-24 | 0.218 |
| 2010-10-25 | 0.221 |
| 2010-10-26 | 0.222 |
| 2010-10-27 | 0.22 |
| 2010-10-28 | 0.221 |
| 2010-10-29 | 0.22 |
| 2010-10-30 | 0.22 |
| 2010-10-31 | 0.22 |
| 2010-11-01 | 0.22 |
| 2010-11-02 | 0.222 |
| 2010-11-03 | 0.226 |
| 2010-11-04 | 0.227 |
| 2010-11-05 | 0.225 |
| 2010-11-06 | 0.225 |
| 2010-11-07 | 0.225 |
| 2010-11-08 | 0.225 |
| 2010-11-09 | 0.225 |
| 2010-11-10 | 0.225 |
| 2010-11-11 | 0.228 |
| 2010-11-12 | 0.231 |
| 2010-11-13 | 0.231 |
| 2010-11-14 | 0.231 |
| 2010-11-15 | 0.231 |
| 2010-11-16 | 0.238 |
| 2010-11-17 | 0.233 |
| 2010-11-18 | 0.233 |
| 2010-11-19 | 0.235 |
| 2010-11-20 | 0.235 |
| 2010-11-21 | 0.235 |
| 2010-11-22 | 0.236 |
| 2010-11-23 | 0.237 |
| 2010-11-24 | 0.235 |
| 2010-11-25 | 0.237 |
| 2010-11-26 | 0.238 |
| 2010-11-27 | 0.238 |
| 2010-11-28 | 0.238 |
| 2010-11-29 | 0.238 |
| 2010-11-30 | 0.238 |
| 2010-12-01 | 0.238 |
| 2010-12-02 | 0.238 |
| 2010-12-03 | 0.237 |
| 2010-12-04 | 0.237 |
| 2010-12-05 | 0.237 |
| 2010-12-06 | 0.236 |
| 2010-12-07 | 0.237 |
| 2010-12-08 | 0.237 |
| 2010-12-09 | 0.241 |
| 2010-12-10 | 0.245 |
| 2010-12-11 | 0.245 |
| 2010-12-12 | 0.245 |
| 2010-12-13 | 0.248 |
| 2010-12-14 | 0.248 |
| 2010-12-15 | 0.247 |
| 2010-12-16 | 0.25 |
| 2010-12-17 | 0.249 |
| 2010-12-18 | 0.249 |
| 2010-12-19 | 0.249 |
| 2010-12-20 | 0.248 |
| 2010-12-21 | 0.248 |
| 2010-12-22 | 0.248 |
| 2010-12-23 | 0.248 |
| 2010-12-24 | 0.247 |
| 2010-12-25 | 0.247 |
| 2010-12-26 | 0.247 |
| 2010-12-27 | 0.246 |
| 2010-12-28 | 0.247 |
| 2010-12-29 | 0.245 |
| 2010-12-30 | 0.249 |
| 2010-12-31 | 0.249 |
| 2011-01-01 | 0.249 |
| 2011-01-02 | 0.249 |
| 2011-01-03 | 0.245 |
| 2011-01-04 | 0.251 |
| 2011-01-05 | 0.252 |
| 2011-01-06 | 0.255 |
| 2011-01-07 | 0.252 |
| 2011-01-08 | 0.252 |
| 2011-01-09 | 0.252 |
| 2011-01-10 | 0.252 |
| 2011-01-11 | 0.252 |
| 2011-01-12 | 0.249 |
| 2011-01-13 | 0.25 |
| 2011-01-14 | 0.25 |
| 2011-01-15 | 0.25 |
| 2011-01-16 | 0.25 |
| 2011-01-17 | 0.253 |
| 2011-01-18 | 0.255 |
| 2011-01-19 | 0.254 |
| 2011-01-20 | 0.255 |
| 2011-01-21 | 0.255 |
| 2011-01-22 | 0.255 |
| 2011-01-23 | 0.255 |
| 2011-01-24 | 0.254 |
| 2011-01-25 | 0.256 |
| 2011-01-26 | 0.254 |
| 2011-01-27 | 0.255 |
| 2011-01-28 | 0.256 |
| 2011-01-29 | 0.256 |
| 2011-01-30 | 0.256 |
| 2011-01-31 | 0.257 |
| 2011-02-01 | 0.26 |
| 2011-02-02 | 0.259 |
| 2011-02-03 | 0.258 |
| 2011-02-04 | 0.259 |
| 2011-02-05 | 0.259 |
| 2011-02-06 | 0.259 |
| 2011-02-07 | 0.26 |
| 2011-02-08 | 0.265 |
| 2011-02-09 | 0.265 |
| 2011-02-10 | 0.264 |
| 2011-02-11 | 0.262 |
| 2011-02-12 | 0.262 |
| 2011-02-13 | 0.262 |
| 2011-02-14 | 0.264 |
| 2011-02-15 | 0.265 |
| 2011-02-16 | 0.265 |
| 2011-02-17 | 0.265 |
| 2011-02-18 | 0.266 |
| 2011-02-19 | 0.266 |
| 2011-02-20 | 0.266 |
| 2011-02-21 | 0.267 |
| 2011-02-22 | 0.269 |
| 2011-02-23 | 0.268 |
| 2011-02-24 | 0.272 |
| 2011-02-25 | 0.272 |
| 2011-02-26 | 0.272 |
| 2011-02-27 | 0.272 |
| 2011-02-28 | 0.271 |
| 2011-03-01 | 0.273 |
| 2011-03-02 | 0.273 |
| 2011-03-03 | 0.274 |
| 2011-03-04 | 0.271 |
| 2011-03-05 | 0.271 |
| 2011-03-06 | 0.271 |
| 2011-03-07 | 0.267 |
| 2011-03-08 | 0.267 |
| 2011-03-09 | 0.266 |
| 2011-03-10 | 0.268 |
| 2011-03-11 | 0.266 |
| 2011-03-12 | 0.266 |
| 2011-03-13 | 0.266 |
| 2011-03-14 | 0.267 |
| 2011-03-15 | 0.268 |
| 2011-03-16 | 0.268 |
| 2011-03-17 | 0.265 |
| 2011-03-18 | 0.266 |
| 2011-03-19 | 0.266 |
| 2011-03-20 | 0.266 |
| 2011-03-21 | 0.266 |
| 2011-03-22 | 0.267 |
| 2011-03-23 | 0.268 |
| 2011-03-24 | 0.27 |
| 2011-03-25 | 0.273 |
| 2011-03-26 | 0.273 |
| 2011-03-27 | 0.273 |
| 2011-03-28 | 0.272 |
| 2011-03-29 | 0.271 |
| 2011-03-30 | 0.27 |
| 2011-03-31 | 0.27 |
| 2011-04-01 | 0.268 |
| 2011-04-02 | 0.268 |
| 2011-04-03 | 0.268 |
| 2011-04-04 | 0.266 |
| 2011-04-05 | 0.265 |
| 2011-04-06 | 0.265 |
| 2011-04-07 | 0.266 |
| 2011-04-08 | 0.265 |
| 2011-04-09 | 0.265 |
| 2011-04-10 | 0.265 |
| 2011-04-11 | 0.262 |
| 2011-04-12 | 0.263 |
| 2011-04-13 | 0.263 |
| 2011-04-14 | 0.263 |
| 2011-04-15 | 0.261 |
| 2011-04-16 | 0.261 |
| 2011-04-17 | 0.261 |
| 2011-04-18 | 0.262 |
| 2011-04-19 | 0.26 |
| 2011-04-20 | 0.259 |
| 2011-04-21 | 0.259 |
| 2011-04-22 | 0.259 |
| 2011-04-23 | 0.259 |
| 2011-04-24 | 0.259 |
| 2011-04-25 | 0.265 |
| 2011-04-26 | 0.266 |
| 2011-04-27 | 0.267 |
| 2011-04-28 | 0.267 |
| 2011-04-29 | 0.267 |
| 2011-04-30 | 0.267 |
| 2011-05-01 | 0.267 |
| 2011-05-02 | 0.266 |
| 2011-05-03 | 0.264 |
| 2011-05-04 | 0.264 |
| 2011-05-05 | 0.264 |
| 2011-05-06 | 0.263 |
| 2011-05-07 | 0.263 |
| 2011-05-08 | 0.263 |
| 2011-05-09 | 0.264 |
| 2011-05-10 | 0.264 |
| 2011-05-11 | 0.266 |
| 2011-05-12 | 0.267 |
| 2011-05-13 | 0.265 |
| 2011-05-14 | 0.265 |
| 2011-05-15 | 0.265 |
| 2011-05-16 | 0.266 |
| 2011-05-17 | 0.267 |
| 2011-05-18 | 0.265 |
| 2011-05-19 | 0.265 |
| 2011-05-20 | 0.264 |
| 2011-05-21 | 0.264 |
| 2011-05-22 | 0.264 |
| 2011-05-23 | 0.267 |
| 2011-05-24 | 0.266 |
| 2011-05-25 | 0.266 |
| 2011-05-26 | 0.265 |
| 2011-05-27 | 0.264 |
| 2011-05-28 | 0.264 |
| 2011-05-29 | 0.264 |
| 2011-05-30 | 0.263 |
| 2011-05-31 | 0.263 |
| 2011-06-01 | 0.26 |
| 2011-06-02 | 0.261 |
| 2011-06-03 | 0.262 |
| 2011-06-04 | 0.262 |
| 2011-06-05 | 0.262 |
| 2011-06-06 | 0.262 |
| 2011-06-07 | 0.259 |
| 2011-06-08 | 0.256 |
| 2011-06-09 | 0.258 |
| 2011-06-10 | 0.259 |
| 2011-06-11 | 0.259 |
| 2011-06-12 | 0.259 |
| 2011-06-13 | 0.259 |
| 2011-06-14 | 0.258 |
| 2011-06-15 | 0.257 |
| 2011-06-16 | 0.256 |
| 2011-06-17 | 0.255 |
| 2011-06-18 | 0.255 |
| 2011-06-19 | 0.255 |
| 2011-06-20 | 0.257 |
| 2011-06-21 | 0.256 |
| 2011-06-22 | 0.257 |
| 2011-06-23 | 0.255 |
| 2011-06-24 | 0.252 |
| 2011-06-25 | 0.252 |
| 2011-06-26 | 0.252 |
| 2011-06-27 | 0.252 |
| 2011-06-28 | 0.252 |
| 2011-06-29 | 0.252 |
| 2011-06-30 | 0.253 |
| 2011-07-01 | 0.255 |
| 2011-07-02 | 0.255 |
| 2011-07-03 | 0.255 |
| 2011-07-04 | 0.255 |
| 2011-07-05 | 0.256 |
| 2011-07-06 | 0.256 |
| 2011-07-07 | 0.255 |
| 2011-07-08 | 0.254 |
| 2011-07-09 | 0.254 |
| 2011-07-10 | 0.254 |
| 2011-07-11 | 0.256 |
| 2011-07-12 | 0.256 |
| 2011-07-13 | 0.256 |
| 2011-07-14 | 0.256 |
| 2011-07-15 | 0.256 |
| 2011-07-16 | 0.256 |
| 2011-07-17 | 0.256 |
| 2011-07-18 | 0.258 |
| 2011-07-19 | 0.258 |
| 2011-07-20 | 0.258 |
| 2011-07-21 | 0.257 |
| 2011-07-22 | 0.256 |
| 2011-07-23 | 0.256 |
| 2011-07-24 | 0.256 |
| 2011-07-25 | 0.257 |
| 2011-07-26 | 0.255 |
| 2011-07-27 | 0.254 |
| 2011-07-28 | 0.253 |
| 2011-07-29 | 0.253 |
| 2011-07-30 | 0.253 |
| 2011-07-31 | 0.253 |
| 2011-08-01 | 0.252 |
| 2011-08-02 | 0.251 |
| 2011-08-03 | 0.251 |
| 2011-08-04 | 0.253 |
| 2011-08-05 | 0.255 |
| 2011-08-06 | 0.255 |
| 2011-08-07 | 0.255 |
| 2011-08-08 | 0.255 |
| 2011-08-09 | 0.255 |
| 2011-08-10 | 0.251 |
| 2011-08-11 | 0.25 |
| 2011-08-12 | 0.249 |
| 2011-08-13 | 0.249 |
| 2011-08-14 | 0.249 |
| 2011-08-15 | 0.249 |
| 2011-08-16 | 0.248 |
| 2011-08-17 | 0.249 |
| 2011-08-18 | 0.246 |
| 2011-08-19 | 0.246 |
| 2011-08-20 | 0.246 |
| 2011-08-21 | 0.246 |
| 2011-08-22 | 0.245 |
| 2011-08-23 | 0.243 |
| 2011-08-24 | 0.244 |
| 2011-08-25 | 0.245 |
| 2011-08-26 | 0.244 |
| 2011-08-27 | 0.244 |
| 2011-08-28 | 0.244 |
| 2011-08-29 | 0.246 |
| 2011-08-30 | 0.245 |
| 2011-08-31 | 0.246 |
| 2011-09-01 | 0.245 |
| 2011-09-02 | 0.243 |
| 2011-09-03 | 0.243 |
| 2011-09-04 | 0.243 |
| 2011-09-05 | 0.241 |
| 2011-09-06 | 0.239 |
| 2011-09-07 | 0.239 |
| 2011-09-08 | 0.238 |
| 2011-09-09 | 0.236 |
| 2011-09-10 | 0.236 |
| 2011-09-11 | 0.236 |
| 2011-09-12 | 0.239 |
| 2011-09-13 | 0.24 |
| 2011-09-14 | 0.241 |
| 2011-09-15 | 0.24 |
| 2011-09-16 | 0.24 |
| 2011-09-17 | 0.24 |
| 2011-09-18 | 0.24 |
| 2011-09-19 | 0.241 |
| 2011-09-20 | 0.241 |
| 2011-09-21 | 0.244 |
| 2011-09-22 | 0.25 |
| 2011-09-23 | 0.253 |
| 2011-09-24 | 0.253 |
| 2011-09-25 | 0.253 |
| 2011-09-26 | 0.251 |
| 2011-09-27 | 0.248 |
| 2011-09-28 | 0.249 |
| 2011-09-29 | 0.25 |
| 2011-09-30 | 0.248 |
| 2011-10-01 | 0.248 |
| 2011-10-02 | 0.248 |
| 2011-10-03 | 0.254 |
| 2011-10-04 | 0.255 |
| 2011-10-05 | 0.253 |
| 2011-10-06 | 0.255 |
| 2011-10-07 | 0.252 |
| 2011-10-08 | 0.252 |
| 2011-10-09 | 0.252 |
| 2011-10-10 | 0.25 |
| 2011-10-11 | 0.249 |
| 2011-10-12 | 0.248 |
| 2011-10-13 | 0.251 |
| 2011-10-14 | 0.249 |
| 2011-10-15 | 0.249 |
| 2011-10-16 | 0.249 |
| 2011-10-17 | 0.249 |
| 2011-10-18 | 0.251 |
| 2011-10-19 | 0.251 |
| 2011-10-20 | 0.254 |
| 2011-10-21 | 0.256 |
| 2011-10-22 | 0.256 |
| 2011-10-23 | 0.256 |
| 2011-10-24 | 0.255 |
| 2011-10-25 | 0.254 |
| 2011-10-26 | 0.254 |
| 2011-10-27 | 0.253 |
| 2011-10-28 | 0.254 |
| 2011-10-29 | 0.254 |
| 2011-10-30 | 0.254 |
| 2011-10-31 | 0.255 |
| 2011-11-01 | 0.255 |
| 2011-11-02 | 0.255 |
| 2011-11-03 | 0.254 |
| 2011-11-04 | 0.255 |
| 2011-11-05 | 0.255 |
| 2011-11-06 | 0.255 |
| 2011-11-07 | 0.255 |
| 2011-11-08 | 0.255 |
| 2011-11-09 | 0.256 |
| 2011-11-10 | 0.256 |
| 2011-11-11 | 0.257 |
| 2011-11-12 | 0.257 |
| 2011-11-13 | 0.257 |
| 2011-11-14 | 0.257 |
| 2011-11-15 | 0.258 |
| 2011-11-16 | 0.258 |
| 2011-11-17 | 0.258 |
| 2011-11-18 | 0.26 |
| 2011-11-19 | 0.26 |
| 2011-11-20 | 0.26 |
| 2011-11-21 | 0.261 |
| 2011-11-22 | 0.26 |
| 2011-11-23 | 0.263 |
| 2011-11-24 | 0.263 |
| 2011-11-25 | 0.262 |
| 2011-11-26 | 0.262 |
| 2011-11-27 | 0.262 |
| 2011-11-28 | 0.26 |
| 2011-11-29 | 0.262 |
| 2011-11-30 | 0.261 |
| 2011-12-01 | 0.26 |
| 2011-12-02 | 0.26 |
| 2011-12-03 | 0.26 |
| 2011-12-04 | 0.26 |
| 2011-12-05 | 0.258 |
| 2011-12-06 | 0.258 |
| 2011-12-07 | 0.259 |
| 2011-12-08 | 0.259 |
| 2011-12-09 | 0.258 |
| 2011-12-10 | 0.258 |
| 2011-12-11 | 0.258 |
| 2011-12-12 | 0.258 |
| 2011-12-13 | 0.258 |
| 2011-12-14 | 0.259 |
| 2011-12-15 | 0.258 |
| 2011-12-16 | 0.257 |
| 2011-12-17 | 0.257 |
| 2011-12-18 | 0.257 |
| 2011-12-19 | 0.258 |
| 2011-12-20 | 0.259 |
| 2011-12-21 | 0.259 |
| 2011-12-22 | 0.261 |
| 2011-12-23 | 0.258 |
| 2011-12-24 | 0.258 |
| 2011-12-25 | 0.258 |
| 2011-12-26 | 0.26 |
| 2011-12-27 | 0.261 |
| 2011-12-28 | 0.261 |
| 2011-12-29 | 0.26 |
| 2011-12-30 | 0.26 |
| 2011-12-31 | 0.26 |
| 2012-01-01 | 0.26 |
| 2012-01-02 | 0.259 |
| 2012-01-03 | 0.259 |
| 2012-01-04 | 0.259 |
| 2012-01-05 | 0.258 |
| 2012-01-06 | 0.258 |
| 2012-01-07 | 0.258 |
| 2012-01-08 | 0.258 |
| 2012-01-09 | 0.258 |
| 2012-01-10 | 0.257 |
| 2012-01-11 | 0.256 |
| 2012-01-12 | 0.256 |
| 2012-01-13 | 0.254 |
| 2012-01-14 | 0.254 |
| 2012-01-15 | 0.254 |
| 2012-01-16 | 0.254 |
| 2012-01-17 | 0.253 |
| 2012-01-18 | 0.254 |
| 2012-01-19 | 0.253 |
| 2012-01-20 | 0.254 |
| 2012-01-21 | 0.254 |
| 2012-01-22 | 0.254 |
| 2012-01-23 | 0.253 |
| 2012-01-24 | 0.254 |
| 2012-01-25 | 0.251 |
| 2012-01-26 | 0.25 |
| 2012-01-27 | 0.25 |
| 2012-01-28 | 0.25 |
| 2012-01-29 | 0.25 |
| 2012-01-30 | 0.252 |
| 2012-01-31 | 0.255 |
| 2012-02-01 | 0.253 |
| 2012-02-02 | 0.251 |
| 2012-02-03 | 0.252 |
| 2012-02-04 | 0.252 |
| 2012-02-05 | 0.252 |
| 2012-02-06 | 0.253 |
| 2012-02-07 | 0.253 |
| 2012-02-08 | 0.254 |
| 2012-02-09 | 0.254 |
| 2012-02-10 | 0.253 |
| 2012-02-11 | 0.253 |
| 2012-02-12 | 0.253 |
| 2012-02-13 | 0.256 |
| 2012-02-14 | 0.255 |
| 2012-02-15 | 0.255 |
| 2012-02-16 | 0.255 |
| 2012-02-17 | 0.254 |
| 2012-02-18 | 0.254 |
| 2012-02-19 | 0.254 |
| 2012-02-20 | 0.255 |
| 2012-02-21 | 0.257 |
| 2012-02-22 | 0.257 |
| 2012-02-23 | 0.257 |
| 2012-02-24 | 0.257 |
| 2012-02-25 | 0.257 |
| 2012-02-26 | 0.257 |
| 2012-02-27 | 0.255 |
| 2012-02-28 | 0.255 |
| 2012-02-29 | 0.255 |
| 2012-03-01 | 0.254 |
| 2012-03-02 | 0.253 |
| 2012-03-03 | 0.253 |
| 2012-03-04 | 0.253 |
| 2012-03-05 | 0.252 |
| 2012-03-06 | 0.251 |
| 2012-03-07 | 0.251 |
| 2012-03-08 | 0.25 |
| 2012-03-09 | 0.25 |
| 2012-03-10 | 0.25 |
| 2012-03-11 | 0.25 |
| 2012-03-12 | 0.25 |
| 2012-03-13 | 0.25 |
| 2012-03-14 | 0.251 |
| 2012-03-15 | 0.252 |
| 2012-03-16 | 0.252 |
| 2012-03-17 | 0.252 |
| 2012-03-18 | 0.252 |
| 2012-03-19 | 0.252 |
| 2012-03-20 | 0.252 |
| 2012-03-21 | 0.252 |
| 2012-03-22 | 0.251 |
| 2012-03-23 | 0.251 |
| 2012-03-24 | 0.251 |
| 2012-03-25 | 0.251 |
| 2012-03-26 | 0.25 |
| 2012-03-27 | 0.25 |
| 2012-03-28 | 0.249 |
| 2012-03-29 | 0.249 |
| 2012-03-30 | 0.249 |
| 2012-03-31 | 0.249 |
| 2012-04-01 | 0.249 |
| 2012-04-02 | 0.247 |
| 2012-04-03 | 0.247 |
| 2012-04-04 | 0.247 |
| 2012-04-05 | 0.247 |
| 2012-04-06 | 0.247 |
| 2012-04-07 | 0.247 |
| 2012-04-08 | 0.247 |
| 2012-04-09 | 0.246 |
| 2012-04-10 | 0.246 |
| 2012-04-11 | 0.246 |
| 2012-04-12 | 0.245 |
| 2012-04-13 | 0.245 |
| 2012-04-14 | 0.245 |
| 2012-04-15 | 0.245 |
| 2012-04-16 | 0.244 |
| 2012-04-17 | 0.244 |
| 2012-04-18 | 0.245 |
| 2012-04-19 | 0.245 |
| 2012-04-20 | 0.245 |
| 2012-04-21 | 0.245 |
| 2012-04-22 | 0.245 |
| 2012-04-23 | 0.245 |
| 2012-04-24 | 0.247 |
| 2012-04-25 | 0.246 |
| 2012-04-26 | 0.245 |
| 2012-04-27 | 0.245 |
| 2012-04-28 | 0.245 |
| 2012-04-29 | 0.245 |
| 2012-04-30 | 0.245 |
| 2012-05-01 | 0.245 |
| 2012-05-02 | 0.246 |
| 2012-05-03 | 0.244 |
| 2012-05-04 | 0.244 |
| 2012-05-05 | 0.244 |
| 2012-05-06 | 0.244 |
| 2012-05-07 | 0.244 |
| 2012-05-08 | 0.244 |
| 2012-05-09 | 0.245 |
| 2012-05-10 | 0.246 |
| 2012-05-11 | 0.246 |
| 2012-05-12 | 0.246 |
| 2012-05-13 | 0.246 |
| 2012-05-14 | 0.248 |
| 2012-05-15 | 0.248 |
| 2012-05-16 | 0.247 |
| 2012-05-17 | 0.248 |
| 2012-05-18 | 0.247 |
| 2012-05-19 | 0.247 |
| 2012-05-20 | 0.247 |
| 2012-05-21 | 0.247 |
| 2012-05-22 | 0.246 |
| 2012-05-23 | 0.248 |
| 2012-05-24 | 0.248 |
| 2012-05-25 | 0.247 |
| 2012-05-26 | 0.247 |
| 2012-05-27 | 0.247 |
| 2012-05-28 | 0.247 |
| 2012-05-29 | 0.246 |
| 2012-05-30 | 0.247 |
| 2012-05-31 | 0.247 |
| 2012-06-01 | 0.246 |
| 2012-06-02 | 0.246 |
| 2012-06-03 | 0.246 |
| 2012-06-04 | 0.245 |
| 2012-06-05 | 0.245 |
| 2012-06-06 | 0.246 |
| 2012-06-07 | 0.245 |
| 2012-06-08 | 0.245 |
| 2012-06-09 | 0.245 |
| 2012-06-10 | 0.245 |
| 2012-06-11 | 0.245 |
| 2012-06-12 | 0.245 |
| 2012-06-13 | 0.245 |
| 2012-06-14 | 0.245 |
| 2012-06-15 | 0.245 |
| 2012-06-16 | 0.245 |
| 2012-06-17 | 0.245 |
| 2012-06-18 | 0.245 |
| 2012-06-19 | 0.244 |
| 2012-06-20 | 0.244 |
| 2012-06-21 | 0.243 |
| 2012-06-22 | 0.243 |
| 2012-06-23 | 0.243 |
| 2012-06-24 | 0.243 |
| 2012-06-25 | 0.242 |
| 2012-06-26 | 0.241 |
| 2012-06-27 | 0.241 |
| 2012-06-28 | 0.242 |
| 2012-06-29 | 0.242 |
| 2012-06-30 | 0.242 |
| 2012-07-01 | 0.242 |
| 2012-07-02 | 0.242 |
| 2012-07-03 | 0.242 |
| 2012-07-04 | 0.241 |
| 2012-07-05 | 0.241 |
| 2012-07-06 | 0.24 |
| 2012-07-07 | 0.24 |
| 2012-07-08 | 0.24 |
| 2012-07-09 | 0.241 |
| 2012-07-10 | 0.24 |
| 2012-07-11 | 0.239 |
| 2012-07-12 | 0.238 |
| 2012-07-13 | 0.237 |
| 2012-07-14 | 0.237 |
| 2012-07-15 | 0.237 |
| 2012-07-16 | 0.236 |
| 2012-07-17 | 0.236 |
| 2012-07-18 | 0.237 |
| 2012-07-19 | 0.236 |
| 2012-07-20 | 0.236 |
| 2012-07-21 | 0.236 |
| 2012-07-22 | 0.236 |
| 2012-07-23 | 0.236 |
| 2012-07-24 | 0.235 |
| 2012-07-25 | 0.235 |
| 2012-07-26 | 0.234 |
| 2012-07-27 | 0.235 |
| 2012-07-28 | 0.235 |
| 2012-07-29 | 0.235 |
| 2012-07-30 | 0.231 |
| 2012-07-31 | 0.229 |
| 2012-08-01 | 0.229 |
| 2012-08-02 | 0.228 |
| 2012-08-03 | 0.228 |
| 2012-08-04 | 0.228 |
| 2012-08-05 | 0.228 |
| 2012-08-06 | 0.227 |
| 2012-08-07 | 0.227 |
| 2012-08-08 | 0.227 |
| 2012-08-09 | 0.228 |
| 2012-08-10 | 0.226 |
| 2012-08-11 | 0.226 |
| 2012-08-12 | 0.226 |
| 2012-08-13 | 0.225 |
| 2012-08-14 | 0.224 |
| 2012-08-15 | 0.223 |
| 2012-08-16 | 0.221 |
| 2012-08-17 | 0.221 |
| 2012-08-18 | 0.221 |
| 2012-08-19 | 0.221 |
| 2012-08-20 | 0.221 |
| 2012-08-21 | 0.221 |
| 2012-08-22 | 0.221 |
| 2012-08-23 | 0.224 |
| 2012-08-24 | 0.223 |
| 2012-08-25 | 0.223 |
| 2012-08-26 | 0.223 |
| 2012-08-27 | 0.223 |
| 2012-08-28 | 0.222 |
| 2012-08-29 | 0.224 |
| 2012-08-30 | 0.223 |
| 2012-08-31 | 0.222 |
| 2012-09-01 | 0.222 |
| 2012-09-02 | 0.222 |
| 2012-09-03 | 0.221 |
| 2012-09-04 | 0.222 |
| 2012-09-05 | 0.222 |
| 2012-09-06 | 0.221 |
| 2012-09-07 | 0.219 |
| 2012-09-08 | 0.219 |
| 2012-09-09 | 0.219 |
| 2012-09-10 | 0.219 |
| 2012-09-11 | 0.22 |
| 2012-09-12 | 0.22 |
| 2012-09-13 | 0.219 |
| 2012-09-14 | 0.22 |
| 2012-09-15 | 0.22 |
| 2012-09-16 | 0.22 |
| 2012-09-17 | 0.22 |
| 2012-09-18 | 0.22 |
| 2012-09-19 | 0.221 |
| 2012-09-20 | 0.219 |
| 2012-09-21 | 0.22 |
| 2012-09-22 | 0.22 |
| 2012-09-23 | 0.22 |
| 2012-09-24 | 0.219 |
| 2012-09-25 | 0.218 |
| 2012-09-26 | 0.217 |
| 2012-09-27 | 0.217 |
| 2012-09-28 | 0.215 |
| 2012-09-29 | 0.215 |
| 2012-09-30 | 0.215 |
| 2012-10-01 | 0.216 |
| 2012-10-02 | 0.215 |
| 2012-10-03 | 0.214 |
| 2012-10-04 | 0.215 |
| 2012-10-05 | 0.213 |
| 2012-10-06 | 0.213 |
| 2012-10-07 | 0.213 |
| 2012-10-08 | 0.212 |
| 2012-10-09 | 0.212 |
| 2012-10-10 | 0.212 |
| 2012-10-11 | 0.212 |
| 2012-10-12 | 0.209 |
| 2012-10-13 | 0.209 |
| 2012-10-14 | 0.209 |
| 2012-10-15 | 0.209 |
| 2012-10-16 | 0.21 |
| 2012-10-17 | 0.211 |
| 2012-10-18 | 0.212 |
| 2012-10-19 | 0.209 |
| 2012-10-20 | 0.209 |
| 2012-10-21 | 0.209 |
| 2012-10-22 | 0.209 |
| 2012-10-23 | 0.21 |
| 2012-10-24 | 0.21 |
| 2012-10-25 | 0.21 |
| 2012-10-26 | 0.209 |
| 2012-10-27 | 0.209 |
| 2012-10-28 | 0.209 |
| 2012-10-29 | 0.211 |
| 2012-10-30 | 0.212 |
| 2012-10-31 | 0.213 |
| 2012-11-01 | 0.213 |
| 2012-11-02 | 0.215 |
| 2012-11-03 | 0.215 |
| 2012-11-04 | 0.215 |
| 2012-11-05 | 0.215 |
| 2012-11-06 | 0.214 |
| 2012-11-07 | 0.213 |
| 2012-11-08 | 0.213 |
| 2012-11-09 | 0.214 |
| 2012-11-10 | 0.214 |
| 2012-11-11 | 0.214 |
| 2012-11-12 | 0.214 |
| 2012-11-13 | 0.215 |
| 2012-11-14 | 0.217 |
| 2012-11-15 | 0.22 |
| 2012-11-16 | 0.221 |
| 2012-11-17 | 0.221 |
| 2012-11-18 | 0.221 |
| 2012-11-19 | 0.218 |
| 2012-11-20 | 0.219 |
| 2012-11-21 | 0.218 |
| 2012-11-22 | 0.219 |
| 2012-11-23 | 0.217 |
| 2012-11-24 | 0.217 |
| 2012-11-25 | 0.217 |
| 2012-11-26 | 0.212 |
| 2012-11-27 | 0.211 |
| 2012-11-28 | 0.21 |
| 2012-11-29 | 0.21 |
| 2012-11-30 | 0.21 |
| 2012-12-01 | 0.21 |
| 2012-12-02 | 0.21 |
| 2012-12-03 | 0.21 |
| 2012-12-04 | 0.21 |
| 2012-12-05 | 0.21 |
| 2012-12-06 | 0.206 |
| 2012-12-07 | 0.206 |
| 2012-12-08 | 0.206 |
| 2012-12-09 | 0.206 |
| 2012-12-10 | 0.205 |
| 2012-12-11 | 0.21 |
| 2012-12-12 | 0.211 |
| 2012-12-13 | 0.209 |
| 2012-12-14 | 0.207 |
| 2012-12-15 | 0.207 |
| 2012-12-16 | 0.207 |
| 2012-12-17 | 0.207 |
| 2012-12-18 | 0.206 |
| 2012-12-19 | 0.205 |
| 2012-12-20 | 0.205 |
| 2012-12-21 | 0.198 |
| 2012-12-22 | 0.198 |
| 2012-12-23 | 0.198 |
| 2012-12-24 | 0.196 |
| 2012-12-25 | 0.196 |
| 2012-12-26 | 0.196 |
| 2012-12-27 | 0.196 |
| 2012-12-28 | 0.194 |
| 2012-12-29 | 0.194 |
| 2012-12-30 | 0.194 |
| 2012-12-31 | 0.194 |
| 2013-01-01 | 0.194 |
| 2013-01-02 | 0.193 |
| 2013-01-03 | 0.193 |
| 2013-01-04 | 0.194 |
| 2013-01-05 | 0.194 |
| 2013-01-06 | 0.194 |
| 2013-01-07 | 0.194 |
| 2013-01-08 | 0.192 |
| 2013-01-09 | 0.191 |
| 2013-01-10 | 0.19 |
| 2013-01-11 | 0.189 |
| 2013-01-12 | 0.189 |
| 2013-01-13 | 0.189 |
| 2013-01-14 | 0.189 |
| 2013-01-15 | 0.188 |
| 2013-01-16 | 0.187 |
| 2013-01-17 | 0.187 |
| 2013-01-18 | 0.186 |
| 2013-01-19 | 0.186 |
| 2013-01-20 | 0.186 |
| 2013-01-21 | 0.186 |
| 2013-01-22 | 0.186 |
| 2013-01-23 | 0.183 |
| 2013-01-24 | 0.184 |
| 2013-01-25 | 0.184 |
| 2013-01-26 | 0.184 |
| 2013-01-27 | 0.184 |
| 2013-01-28 | 0.184 |
| 2013-01-29 | 0.184 |
| 2013-01-30 | 0.185 |
| 2013-01-31 | 0.184 |
| 2013-02-01 | 0.184 |
| 2013-02-02 | 0.184 |
| 2013-02-03 | 0.184 |
| 2013-02-04 | 0.184 |
| 2013-02-05 | 0.183 |
| 2013-02-06 | 0.18 |
| 2013-02-07 | 0.179 |
| 2013-02-08 | 0.179 |
| 2013-02-09 | 0.179 |
| 2013-02-10 | 0.179 |
| 2013-02-11 | 0.18 |
| 2013-02-12 | 0.18 |
| 2013-02-13 | 0.179 |
| 2013-02-14 | 0.179 |
| 2013-02-15 | 0.177 |
| 2013-02-16 | 0.177 |
| 2013-02-17 | 0.177 |
| 2013-02-18 | 0.177 |
| 2013-02-19 | 0.176 |
| 2013-02-20 | 0.176 |
| 2013-02-21 | 0.175 |
| 2013-02-22 | 0.174 |
| 2013-02-23 | 0.174 |
| 2013-02-24 | 0.174 |
| 2013-02-25 | 0.175 |
| 2013-02-26 | 0.175 |
| 2013-02-27 | 0.175 |
| 2013-02-28 | 0.174 |
| 2013-03-01 | 0.173 |
| 2013-03-02 | 0.173 |
| 2013-03-03 | 0.173 |
| 2013-03-04 | 0.173 |
| 2013-03-05 | 0.172 |
| 2013-03-06 | 0.171 |
| 2013-03-07 | 0.169 |
| 2013-03-08 | 0.17 |
| 2013-03-09 | 0.17 |
| 2013-03-10 | 0.17 |
| 2013-03-11 | 0.17 |
| 2013-03-12 | 0.171 |
| 2013-03-13 | 0.17 |
| 2013-03-14 | 0.171 |
| 2013-03-15 | 0.171 |
| 2013-03-16 | 0.171 |
| 2013-03-17 | 0.171 |
| 2013-03-18 | 0.171 |
| 2013-03-19 | 0.171 |
| 2013-03-20 | 0.173 |
| 2013-03-21 | 0.175 |
| 2013-03-22 | 0.177 |
| 2013-03-23 | 0.177 |
| 2013-03-24 | 0.177 |
| 2013-03-25 | 0.177 |
| 2013-03-26 | 0.166 |
| 2013-03-27 | 0.167 |
| 2013-03-28 | 0.167 |
| 2013-03-29 | 0.167 |
| 2013-03-30 | 0.167 |
| 2013-03-31 | 0.167 |
| 2013-04-01 | 0.17 |
| 2013-04-02 | 0.17 |
| 2013-04-03 | 0.173 |
| 2013-04-04 | 0.174 |
| 2013-04-05 | 0.17 |
| 2013-04-06 | 0.17 |
| 2013-04-07 | 0.17 |
| 2013-04-08 | 0.169 |
| 2013-04-09 | 0.17 |
| 2013-04-10 | 0.171 |
| 2013-04-11 | 0.17 |
| 2013-04-12 | 0.17 |
| 2013-04-13 | 0.17 |
| 2013-04-14 | 0.17 |
| 2013-04-15 | 0.17 |
| 2013-04-16 | 0.17 |
| 2013-04-17 | 0.17 |
| 2013-04-18 | 0.17 |
| 2013-04-19 | 0.169 |
| 2013-04-20 | 0.169 |
| 2013-04-21 | 0.169 |
| 2013-04-22 | 0.169 |
| 2013-04-23 | 0.169 |
| 2013-04-24 | 0.168 |
| 2013-04-25 | 0.168 |
| 2013-04-26 | 0.168 |
| 2013-04-27 | 0.168 |
| 2013-04-28 | 0.168 |
| 2013-04-29 | 0.17 |
| 2013-04-30 | 0.17 |
| 2013-05-01 | 0.17 |
| 2013-05-02 | 0.17 |
| 2013-05-03 | 0.172 |
| 2013-05-04 | 0.172 |
| 2013-05-05 | 0.172 |
| 2013-05-06 | 0.176 |
| 2013-05-07 | 0.179 |
| 2013-05-08 | 0.178 |
| 2013-05-09 | 0.176 |
| 2013-05-10 | 0.177 |
| 2013-05-11 | 0.177 |
| 2013-05-12 | 0.177 |
| 2013-05-13 | 0.177 |
| 2013-05-14 | 0.177 |
| 2013-05-15 | 0.177 |
| 2013-05-16 | 0.178 |
| 2013-05-17 | 0.178 |
| 2013-05-18 | 0.178 |
| 2013-05-19 | 0.178 |
| 2013-05-20 | 0.176 |
| 2013-05-21 | 0.179 |
| 2013-05-22 | 0.179 |
| 2013-05-23 | 0.182 |
| 2013-05-24 | 0.182 |
| 2013-05-25 | 0.182 |
| 2013-05-26 | 0.182 |
| 2013-05-27 | 0.183 |
| 2013-05-28 | 0.187 |
| 2013-05-29 | 0.191 |
| 2013-05-30 | 0.198 |
| 2013-05-31 | 0.197 |
| 2013-06-01 | 0.197 |
| 2013-06-02 | 0.197 |
| 2013-06-03 | 0.197 |
| 2013-06-04 | 0.201 |
| 2013-06-05 | 0.209 |
| 2013-06-06 | 0.216 |
| 2013-06-07 | 0.212 |
| 2013-06-08 | 0.212 |
| 2013-06-09 | 0.212 |
| 2013-06-10 | 0.212 |
| 2013-06-11 | 0.219 |
| 2013-06-12 | 0.221 |
| 2013-06-13 | 0.218 |
| 2013-06-14 | 0.215 |
| 2013-06-15 | 0.215 |
| 2013-06-16 | 0.215 |
| 2013-06-17 | 0.215 |
| 2013-06-18 | 0.218 |
| 2013-06-19 | 0.219 |
| 2013-06-20 | 0.231 |
| 2013-06-21 | 0.233 |
| 2013-06-22 | 0.233 |
| 2013-06-23 | 0.233 |
| 2013-06-24 | 0.244 |
| 2013-06-25 | 0.239 |
| 2013-06-26 | 0.234 |
| 2013-06-27 | 0.228 |
| 2013-06-28 | 0.227 |
| 2013-06-29 | 0.227 |
| 2013-06-30 | 0.227 |
| 2013-07-01 | 0.227 |
| 2013-07-02 | 0.228 |
| 2013-07-03 | 0.228 |
| 2013-07-04 | 0.23 |
| 2013-07-05 | 0.233 |
| 2013-07-06 | 0.233 |
| 2013-07-07 | 0.233 |
| 2013-07-08 | 0.231 |
| 2013-07-09 | 0.228 |
| 2013-07-10 | 0.228 |
| 2013-07-11 | 0.221 |
| 2013-07-12 | 0.217 |
| 2013-07-13 | 0.217 |
| 2013-07-14 | 0.217 |
| 2013-07-15 | 0.219 |
| 2013-07-16 | 0.219 |
| 2013-07-17 | 0.219 |
| 2013-07-18 | 0.222 |
| 2013-07-19 | 0.221 |
| 2013-07-20 | 0.221 |
| 2013-07-21 | 0.221 |
| 2013-07-22 | 0.221 |
| 2013-07-23 | 0.219 |
| 2013-07-24 | 0.227 |
| 2013-07-25 | 0.23 |
| 2013-07-26 | 0.228 |
| 2013-07-27 | 0.228 |
| 2013-07-28 | 0.228 |
| 2013-07-29 | 0.229 |
| 2013-07-30 | 0.229 |
| 2013-07-31 | 0.231 |
| 2013-08-01 | 0.231 |
| 2013-08-02 | 0.227 |
| 2013-08-03 | 0.227 |
| 2013-08-04 | 0.227 |
| 2013-08-05 | 0.227 |
| 2013-08-06 | 0.226 |
| 2013-08-07 | 0.226 |
| 2013-08-08 | 0.226 |
| 2013-08-09 | 0.228 |
| 2013-08-10 | 0.228 |
| 2013-08-11 | 0.228 |
| 2013-08-12 | 0.227 |
| 2013-08-13 | 0.232 |
| 2013-08-14 | 0.232 |
| 2013-08-15 | 0.236 |
| 2013-08-16 | 0.238 |
| 2013-08-17 | 0.238 |
| 2013-08-18 | 0.238 |
| 2013-08-19 | 0.238 |
| 2013-08-20 | 0.239 |
| 2013-08-21 | 0.241 |
| 2013-08-22 | 0.24 |
| 2013-08-23 | 0.237 |
| 2013-08-24 | 0.237 |
| 2013-08-25 | 0.237 |
| 2013-08-26 | 0.237 |
| 2013-08-27 | 0.239 |
| 2013-08-28 | 0.24 |
| 2013-08-29 | 0.241 |
| 2013-08-30 | 0.241 |
| 2013-08-31 | 0.241 |
| 2013-09-01 | 0.241 |
| 2013-09-02 | 0.238 |
| 2013-09-03 | 0.24 |
| 2013-09-04 | 0.239 |
| 2013-09-05 | 0.24 |
| 2013-09-06 | 0.238 |
| 2013-09-07 | 0.238 |
| 2013-09-08 | 0.238 |
| 2013-09-09 | 0.236 |
| 2013-09-10 | 0.235 |
| 2013-09-11 | 0.231 |
| 2013-09-12 | 0.228 |
| 2013-09-13 | 0.227 |
| 2013-09-14 | 0.227 |
| 2013-09-15 | 0.227 |
| 2013-09-16 | 0.226 |
| 2013-09-17 | 0.23 |
| 2013-09-18 | 0.23 |
| 2013-09-19 | 0.226 |
| 2013-09-20 | 0.224 |
| 2013-09-21 | 0.224 |
| 2013-09-22 | 0.224 |
| 2013-09-23 | 0.228 |
| 2013-09-24 | 0.226 |
| 2013-09-25 | 0.225 |
| 2013-09-26 | 0.225 |
| 2013-09-27 | 0.221 |
| 2013-09-28 | 0.221 |
| 2013-09-29 | 0.221 |
| 2013-09-30 | 0.226 |
| 2013-10-01 | 0.228 |
| 2013-10-02 | 0.227 |
| 2013-10-03 | 0.227 |
| 2013-10-04 | 0.225 |
| 2013-10-05 | 0.225 |
| 2013-10-06 | 0.225 |
| 2013-10-07 | 0.223 |
| 2013-10-08 | 0.224 |
| 2013-10-09 | 0.226 |
| 2013-10-10 | 0.225 |
| 2013-10-11 | 0.223 |
| 2013-10-12 | 0.223 |
| 2013-10-13 | 0.223 |
| 2013-10-14 | 0.223 |
| 2013-10-15 | 0.222 |
| 2013-10-16 | 0.223 |
| 2013-10-17 | 0.219 |
| 2013-10-18 | 0.218 |
| 2013-10-19 | 0.218 |
| 2013-10-20 | 0.218 |
| 2013-10-21 | 0.218 |
| 2013-10-22 | 0.213 |
| 2013-10-23 | 0.213 |
| 2013-10-24 | 0.212 |
| 2013-10-25 | 0.212 |
| 2013-10-26 | 0.212 |
| 2013-10-27 | 0.212 |
| 2013-10-28 | 0.217 |
| 2013-10-29 | 0.213 |
| 2013-10-30 | 0.213 |
| 2013-10-31 | 0.217 |
| 2013-11-01 | 0.223 |
| 2013-11-02 | 0.223 |
| 2013-11-03 | 0.223 |
| 2013-11-04 | 0.223 |
| 2013-11-05 | 0.227 |
| 2013-11-06 | 0.222 |
| 2013-11-07 | 0.226 |
| 2013-11-08 | 0.231 |
| 2013-11-09 | 0.231 |
| 2013-11-10 | 0.231 |
| 2013-11-11 | 0.231 |
| 2013-11-12 | 0.233 |
| 2013-11-13 | 0.232 |
| 2013-11-14 | 0.23 |
| 2013-11-15 | 0.228 |
| 2013-11-16 | 0.228 |
| 2013-11-17 | 0.228 |
| 2013-11-18 | 0.226 |
| 2013-11-19 | 0.224 |
| 2013-11-20 | 0.225 |
| 2013-11-21 | 0.228 |
| 2013-11-22 | 0.224 |
| 2013-11-23 | 0.224 |
| 2013-11-24 | 0.224 |
| 2013-11-25 | 0.224 |
| 2013-11-26 | 0.224 |
| 2013-11-27 | 0.225 |
| 2013-11-28 | 0.224 |
| 2013-11-29 | 0.225 |
| 2013-11-30 | 0.225 |
| 2013-12-01 | 0.225 |
| 2013-12-02 | 0.225 |
| 2013-12-03 | 0.227 |
| 2013-12-04 | 0.229 |
| 2013-12-05 | 0.229 |
| 2013-12-06 | 0.225 |
| 2013-12-07 | 0.225 |
| 2013-12-08 | 0.225 |
| 2013-12-09 | 0.222 |
| 2013-12-10 | 0.222 |
| 2013-12-11 | 0.223 |
| 2013-12-12 | 0.224 |
| 2013-12-13 | 0.226 |
| 2013-12-14 | 0.226 |
| 2013-12-15 | 0.226 |
| 2013-12-16 | 0.224 |
| 2013-12-17 | 0.224 |
| 2013-12-18 | 0.225 |
| 2013-12-19 | 0.225 |
| 2013-12-20 | 0.223 |
| 2013-12-21 | 0.223 |
| 2013-12-22 | 0.223 |
| 2013-12-23 | 0.221 |
| 2013-12-24 | 0.22 |
| 2013-12-25 | 0.22 |
| 2013-12-26 | 0.22 |
| 2013-12-27 | 0.221 |
| 2013-12-28 | 0.221 |
| 2013-12-29 | 0.221 |
| 2013-12-30 | 0.224 |
| 2013-12-31 | 0.224 |
| 2014-01-01 | 0.224 |
| 2014-01-02 | 0.224 |
| 2014-01-03 | 0.222 |
| 2014-01-04 | 0.222 |
| 2014-01-05 | 0.222 |
| 2014-01-06 | 0.222 |
| 2014-01-07 | 0.223 |
| 2014-01-08 | 0.224 |
| 2014-01-09 | 0.224 |
| 2014-01-10 | 0.222 |
| 2014-01-11 | 0.222 |
| 2014-01-12 | 0.222 |
| 2014-01-13 | 0.221 |
| 2014-01-14 | 0.221 |
| 2014-01-15 | 0.221 |
| 2014-01-16 | 0.22 |
| 2014-01-17 | 0.222 |
| 2014-01-18 | 0.222 |
| 2014-01-19 | 0.222 |
| 2014-01-20 | 0.223 |
| 2014-01-21 | 0.224 |
| 2014-01-22 | 0.224 |
| 2014-01-23 | 0.222 |
| 2014-01-24 | 0.226 |
| 2014-01-25 | 0.226 |
| 2014-01-26 | 0.226 |
| 2014-01-27 | 0.226 |
| 2014-01-28 | 0.224 |
| 2014-01-29 | 0.227 |
| 2014-01-30 | 0.228 |
| 2014-01-31 | 0.235 |
| 2014-02-01 | 0.235 |
| 2014-02-02 | 0.235 |
| 2014-02-03 | 0.233 |
| 2014-02-04 | 0.235 |
| 2014-02-05 | 0.233 |
| 2014-02-06 | 0.231 |
| 2014-02-07 | 0.232 |
| 2014-02-08 | 0.232 |
| 2014-02-09 | 0.232 |
| 2014-02-10 | 0.231 |
| 2014-02-11 | 0.231 |
| 2014-02-12 | 0.231 |
| 2014-02-13 | 0.232 |
| 2014-02-14 | 0.229 |
| 2014-02-15 | 0.229 |
| 2014-02-16 | 0.229 |
| 2014-02-17 | 0.23 |
| 2014-02-18 | 0.229 |
| 2014-02-19 | 0.232 |
| 2014-02-20 | 0.235 |
| 2014-02-21 | 0.234 |
| 2014-02-22 | 0.234 |
| 2014-02-23 | 0.234 |
| 2014-02-24 | 0.234 |
| 2014-02-25 | 0.233 |
| 2014-02-26 | 0.233 |
| 2014-02-27 | 0.234 |
| 2014-02-28 | 0.232 |
| 2014-03-01 | 0.232 |
| 2014-03-02 | 0.232 |
| 2014-03-03 | 0.233 |
| 2014-03-04 | 0.231 |
| 2014-03-05 | 0.231 |
| 2014-03-06 | 0.229 |
| 2014-03-07 | 0.229 |
| 2014-03-08 | 0.229 |
| 2014-03-09 | 0.229 |
| 2014-03-10 | 0.23 |
| 2014-03-11 | 0.229 |
| 2014-03-12 | 0.228 |
| 2014-03-13 | 0.228 |
| 2014-03-14 | 0.228 |
| 2014-03-15 | 0.228 |
| 2014-03-16 | 0.228 |
| 2014-03-17 | 0.229 |
| 2014-03-18 | 0.23 |
| 2014-03-19 | 0.225 |
| 2014-03-20 | 0.218 |
| 2014-03-21 | 0.217 |
| 2014-03-22 | 0.217 |
| 2014-03-23 | 0.217 |
| 2014-03-24 | 0.217 |
| 2014-03-25 | 0.216 |
| 2014-03-26 | 0.211 |
| 2014-03-27 | 0.211 |
| 2014-03-28 | 0.212 |
| 2014-03-29 | 0.212 |
| 2014-03-30 | 0.212 |
| 2014-03-31 | 0.213 |
| 2014-04-01 | 0.212 |
| 2014-04-02 | 0.212 |
| 2014-04-03 | 0.212 |
| 2014-04-04 | 0.211 |
| 2014-04-05 | 0.211 |
| 2014-04-06 | 0.211 |
| 2014-04-07 | 0.209 |
| 2014-04-08 | 0.205 |
| 2014-04-09 | 0.205 |
| 2014-04-10 | 0.206 |
| 2014-04-11 | 0.206 |
| 2014-04-12 | 0.206 |
| 2014-04-13 | 0.206 |
| 2014-04-14 | 0.206 |
| 2014-04-15 | 0.207 |
| 2014-04-16 | 0.207 |
| 2014-04-17 | 0.207 |
| 2014-04-18 | 0.207 |
| 2014-04-19 | 0.207 |
| 2014-04-20 | 0.207 |
| 2014-04-21 | 0.207 |
| 2014-04-22 | 0.209 |
| 2014-04-23 | 0.209 |
| 2014-04-24 | 0.211 |
| 2014-04-25 | 0.211 |
| 2014-04-26 | 0.211 |
| 2014-04-27 | 0.211 |
| 2014-04-28 | 0.216 |
| 2014-04-29 | 0.215 |
| 2014-04-30 | 0.214 |
| 2014-05-01 | 0.214 |
| 2014-05-02 | 0.215 |
| 2014-05-03 | 0.215 |
| 2014-05-04 | 0.215 |
| 2014-05-05 | 0.215 |
| 2014-05-06 | 0.216 |
| 2014-05-07 | 0.214 |
| 2014-05-08 | 0.213 |
| 2014-05-09 | 0.213 |
| 2014-05-10 | 0.213 |
| 2014-05-11 | 0.213 |
| 2014-05-12 | 0.212 |
| 2014-05-13 | 0.214 |
| 2014-05-14 | 0.214 |
| 2014-05-15 | 0.215 |
| 2014-05-16 | 0.214 |
| 2014-05-17 | 0.214 |
| 2014-05-18 | 0.214 |
| 2014-05-19 | 0.216 |
| 2014-05-20 | 0.217 |
| 2014-05-21 | 0.216 |
| 2014-05-22 | 0.214 |
| 2014-05-23 | 0.214 |
| 2014-05-24 | 0.214 |
| 2014-05-25 | 0.214 |
| 2014-05-26 | 0.215 |
| 2014-05-27 | 0.216 |
| 2014-05-28 | 0.217 |
| 2014-05-29 | 0.214 |
| 2014-05-30 | 0.215 |
| 2014-05-31 | 0.215 |
| 2014-06-01 | 0.215 |
| 2014-06-02 | 0.215 |
| 2014-06-03 | 0.219 |
| 2014-06-04 | 0.219 |
| 2014-06-05 | 0.218 |
| 2014-06-06 | 0.216 |
| 2014-06-07 | 0.216 |
| 2014-06-08 | 0.216 |
| 2014-06-09 | 0.216 |
| 2014-06-10 | 0.217 |
| 2014-06-11 | 0.218 |
| 2014-06-12 | 0.217 |
| 2014-06-13 | 0.218 |
| 2014-06-14 | 0.218 |
| 2014-06-15 | 0.218 |
| 2014-06-16 | 0.221 |
| 2014-06-17 | 0.227 |
| 2014-06-18 | 0.227 |
| 2014-06-19 | 0.226 |
| 2014-06-20 | 0.226 |
| 2014-06-21 | 0.226 |
| 2014-06-22 | 0.226 |
| 2014-06-23 | 0.226 |
| 2014-06-24 | 0.224 |
| 2014-06-25 | 0.225 |
| 2014-06-26 | 0.225 |
| 2014-06-27 | 0.225 |
| 2014-06-28 | 0.225 |
| 2014-06-29 | 0.225 |
| 2014-06-30 | 0.225 |
| 2014-07-01 | 0.225 |
| 2014-07-02 | 0.226 |
| 2014-07-03 | 0.228 |
| 2014-07-04 | 0.226 |
| 2014-07-05 | 0.226 |
| 2014-07-06 | 0.226 |
| 2014-07-07 | 0.224 |
| 2014-07-08 | 0.224 |
| 2014-07-09 | 0.226 |
| 2014-07-10 | 0.227 |
| 2014-07-11 | 0.226 |
| 2014-07-12 | 0.226 |
| 2014-07-13 | 0.226 |
| 2014-07-14 | 0.226 |
| 2014-07-15 | 0.227 |
| 2014-07-16 | 0.227 |
| 2014-07-17 | 0.227 |
| 2014-07-18 | 0.227 |
| 2014-07-19 | 0.227 |
| 2014-07-20 | 0.227 |
| 2014-07-21 | 0.225 |
| 2014-07-22 | 0.224 |
| 2014-07-23 | 0.224 |
| 2014-07-24 | 0.223 |
| 2014-07-25 | 0.223 |
| 2014-07-26 | 0.223 |
| 2014-07-27 | 0.223 |
| 2014-07-28 | 0.222 |
| 2014-07-29 | 0.223 |
| 2014-07-30 | 0.226 |
| 2014-07-31 | 0.228 |
| 2014-08-01 | 0.227 |
| 2014-08-02 | 0.227 |
| 2014-08-03 | 0.227 |
| 2014-08-04 | 0.227 |
| 2014-08-05 | 0.227 |
| 2014-08-06 | 0.227 |
| 2014-08-07 | 0.227 |
| 2014-08-08 | 0.228 |
| 2014-08-09 | 0.228 |
| 2014-08-10 | 0.228 |
| 2014-08-11 | 0.227 |
| 2014-08-12 | 0.227 |
| 2014-08-13 | 0.227 |
| 2014-08-14 | 0.227 |
| 2014-08-15 | 0.225 |
| 2014-08-16 | 0.225 |
| 2014-08-17 | 0.225 |
| 2014-08-18 | 0.225 |
| 2014-08-19 | 0.225 |
| 2014-08-20 | 0.226 |
| 2014-08-21 | 0.226 |
| 2014-08-22 | 0.227 |
| 2014-08-23 | 0.227 |
| 2014-08-24 | 0.227 |
| 2014-08-25 | 0.226 |
| 2014-08-26 | 0.226 |
| 2014-08-27 | 0.225 |
| 2014-08-28 | 0.223 |
| 2014-08-29 | 0.221 |
| 2014-08-30 | 0.221 |
| 2014-08-31 | 0.221 |
| 2014-09-01 | 0.222 |
| 2014-09-02 | 0.224 |
| 2014-09-03 | 0.223 |
| 2014-09-04 | 0.224 |
| 2014-09-05 | 0.223 |
| 2014-09-06 | 0.223 |
| 2014-09-07 | 0.223 |
| 2014-09-08 | 0.222 |
| 2014-09-09 | 0.226 |
| 2014-09-10 | 0.227 |
| 2014-09-11 | 0.227 |
| 2014-09-12 | 0.227 |
| 2014-09-13 | 0.227 |
| 2014-09-14 | 0.227 |
| 2014-09-15 | 0.226 |
| 2014-09-16 | 0.225 |
| 2014-09-17 | 0.224 |
| 2014-09-18 | 0.225 |
| 2014-09-19 | 0.224 |
| 2014-09-20 | 0.224 |
| 2014-09-21 | 0.224 |
| 2014-09-22 | 0.225 |
| 2014-09-23 | 0.225 |
| 2014-09-24 | 0.226 |
| 2014-09-25 | 0.227 |
| 2014-09-26 | 0.228 |
| 2014-09-27 | 0.228 |
| 2014-09-28 | 0.228 |
| 2014-09-29 | 0.232 |
| 2014-09-30 | 0.232 |
| 2014-10-01 | 0.23 |
| 2014-10-02 | 0.229 |
| 2014-10-03 | 0.23 |
| 2014-10-04 | 0.23 |
| 2014-10-05 | 0.23 |
| 2014-10-06 | 0.229 |
| 2014-10-07 | 0.229 |
| 2014-10-08 | 0.229 |
| 2014-10-09 | 0.228 |
| 2014-10-10 | 0.23 |
| 2014-10-11 | 0.23 |
| 2014-10-12 | 0.23 |
| 2014-10-13 | 0.23 |
| 2014-10-14 | 0.229 |
| 2014-10-15 | 0.228 |
| 2014-10-16 | 0.229 |
| 2014-10-17 | 0.227 |
| 2014-10-18 | 0.227 |
| 2014-10-19 | 0.227 |
| 2014-10-20 | 0.227 |
| 2014-10-21 | 0.226 |
| 2014-10-22 | 0.226 |
| 2014-10-23 | 0.228 |
| 2014-10-24 | 0.228 |
| 2014-10-25 | 0.228 |
| 2014-10-26 | 0.228 |
| 2014-10-27 | 0.228 |
| 2014-10-28 | 0.227 |
| 2014-10-29 | 0.226 |
| 2014-10-30 | 0.225 |
| 2014-10-31 | 0.225 |
| 2014-11-01 | 0.225 |
| 2014-11-02 | 0.225 |
| 2014-11-03 | 0.225 |
| 2014-11-04 | 0.225 |
| 2014-11-05 | 0.224 |
| 2014-11-06 | 0.224 |
| 2014-11-07 | 0.224 |
| 2014-11-08 | 0.224 |
| 2014-11-09 | 0.224 |
| 2014-11-10 | 0.223 |
| 2014-11-11 | 0.224 |
| 2014-11-12 | 0.222 |
| 2014-11-13 | 0.223 |
| 2014-11-14 | 0.224 |
| 2014-11-15 | 0.224 |
| 2014-11-16 | 0.224 |
| 2014-11-17 | 0.224 |
| 2014-11-18 | 0.224 |
| 2014-11-19 | 0.223 |
| 2014-11-20 | 0.222 |
| 2014-11-21 | 0.221 |
| 2014-11-22 | 0.221 |
| 2014-11-23 | 0.221 |
| 2014-11-24 | 0.219 |
| 2014-11-25 | 0.22 |
| 2014-11-26 | 0.22 |
| 2014-11-27 | 0.221 |
| 2014-11-28 | 0.221 |
| 2014-11-29 | 0.221 |
| 2014-11-30 | 0.221 |
| 2014-12-01 | 0.221 |
| 2014-12-02 | 0.221 |
| 2014-12-03 | 0.222 |
| 2014-12-04 | 0.224 |
| 2014-12-05 | 0.226 |
| 2014-12-06 | 0.226 |
| 2014-12-07 | 0.226 |
| 2014-12-08 | 0.226 |
| 2014-12-09 | 0.231 |
| 2014-12-10 | 0.237 |
| 2014-12-11 | 0.237 |
| 2014-12-12 | 0.236 |
| 2014-12-13 | 0.236 |
| 2014-12-14 | 0.236 |
| 2014-12-15 | 0.238 |
| 2014-12-16 | 0.242 |
| 2014-12-17 | 0.24 |
| 2014-12-18 | 0.237 |
| 2014-12-19 | 0.238 |
| 2014-12-20 | 0.238 |
| 2014-12-21 | 0.238 |
| 2014-12-22 | 0.239 |
| 2014-12-23 | 0.24 |
| 2014-12-24 | 0.24 |
| 2014-12-25 | 0.24 |
| 2014-12-26 | 0.239 |
| 2014-12-27 | 0.239 |
| 2014-12-28 | 0.239 |
| 2014-12-29 | 0.239 |
| 2014-12-30 | 0.239 |
| 2014-12-31 | 0.239 |
| 2015-01-01 | 0.239 |
| 2015-01-02 | 0.238 |
| 2015-01-03 | 0.238 |
| 2015-01-04 | 0.238 |
| 2015-01-05 | 0.238 |
| 2015-01-06 | 0.239 |
| 2015-01-07 | 0.237 |
| 2015-01-08 | 0.232 |
| 2015-01-09 | 0.232 |
| 2015-01-10 | 0.232 |
| 2015-01-11 | 0.232 |
| 2015-01-12 | 0.232 |
| 2015-01-13 | 0.233 |
| 2015-01-14 | 0.232 |
| 2015-01-15 | 0.228 |
| 2015-01-16 | 0.226 |
| 2015-01-17 | 0.226 |
| 2015-01-18 | 0.226 |
| 2015-01-19 | 0.225 |
| 2015-01-20 | 0.225 |
| 2015-01-21 | 0.224 |
| 2015-01-22 | 0.22 |
| 2015-01-23 | 0.218 |
| 2015-01-24 | 0.218 |
| 2015-01-25 | 0.218 |
| 2015-01-26 | 0.219 |
| 2015-01-27 | 0.217 |
| 2015-01-28 | 0.217 |
| 2015-01-29 | 0.216 |
| 2015-01-30 | 0.219 |
| 2015-01-31 | 0.219 |
| 2015-02-01 | 0.219 |
| 2015-02-02 | 0.216 |
| 2015-02-03 | 0.217 |
| 2015-02-04 | 0.219 |
| 2015-02-05 | 0.22 |
| 2015-02-06 | 0.223 |
| 2015-02-07 | 0.223 |
| 2015-02-08 | 0.223 |
| 2015-02-09 | 0.224 |
| 2015-02-10 | 0.226 |
| 2015-02-11 | 0.226 |
| 2015-02-12 | 0.224 |
| 2015-02-13 | 0.222 |
| 2015-02-14 | 0.222 |
| 2015-02-15 | 0.222 |
| 2015-02-16 | 0.222 |
| 2015-02-17 | 0.223 |
| 2015-02-18 | 0.223 |
| 2015-02-19 | 0.222 |
| 2015-02-20 | 0.223 |
| 2015-02-21 | 0.223 |
| 2015-02-22 | 0.223 |
| 2015-02-23 | 0.222 |
| 2015-02-24 | 0.221 |
| 2015-02-25 | 0.219 |
| 2015-02-26 | 0.218 |
| 2015-02-27 | 0.219 |
| 2015-02-28 | 0.219 |
| 2015-03-01 | 0.219 |
| 2015-03-02 | 0.22 |
| 2015-03-03 | 0.221 |
| 2015-03-04 | 0.222 |
| 2015-03-05 | 0.222 |
| 2015-03-06 | 0.229 |
| 2015-03-07 | 0.229 |
| 2015-03-08 | 0.229 |
| 2015-03-09 | 0.231 |
| 2015-03-10 | 0.234 |
| 2015-03-11 | 0.233 |
| 2015-03-12 | 0.232 |
| 2015-03-13 | 0.237 |
| 2015-03-14 | 0.237 |
| 2015-03-15 | 0.237 |
| 2015-03-16 | 0.238 |
| 2015-03-17 | 0.236 |
| 2015-03-18 | 0.234 |
| 2015-03-19 | 0.232 |
| 2015-03-20 | 0.231 |
| 2015-03-21 | 0.231 |
| 2015-03-22 | 0.231 |
| 2015-03-23 | 0.231 |
| 2015-03-24 | 0.23 |
| 2015-03-25 | 0.231 |
| 2015-03-26 | 0.233 |
| 2015-03-27 | 0.234 |
| 2015-03-28 | 0.234 |
| 2015-03-29 | 0.234 |
| 2015-03-30 | 0.236 |
| 2015-03-31 | 0.235 |
| 2015-04-01 | 0.234 |
| 2015-04-02 | 0.234 |
| 2015-04-03 | 0.234 |
| 2015-04-04 | 0.234 |
| 2015-04-05 | 0.234 |
| 2015-04-06 | 0.231 |
| 2015-04-07 | 0.23 |
| 2015-04-08 | 0.228 |
| 2015-04-09 | 0.229 |
| 2015-04-10 | 0.229 |
| 2015-04-11 | 0.229 |
| 2015-04-12 | 0.229 |
| 2015-04-13 | 0.228 |
| 2015-04-14 | 0.227 |
| 2015-04-15 | 0.226 |
| 2015-04-16 | 0.226 |
| 2015-04-17 | 0.226 |
| 2015-04-18 | 0.226 |
| 2015-04-19 | 0.226 |
| 2015-04-20 | 0.226 |
| 2015-04-21 | 0.226 |
| 2015-04-22 | 0.227 |
| 2015-04-23 | 0.226 |
| 2015-04-24 | 0.225 |
| 2015-04-25 | 0.225 |
| 2015-04-26 | 0.225 |
| 2015-04-27 | 0.225 |
| 2015-04-28 | 0.226 |
| 2015-04-29 | 0.225 |
| 2015-04-30 | 0.226 |
| 2015-05-01 | 0.226 |
| 2015-05-02 | 0.226 |
| 2015-05-03 | 0.226 |
| 2015-05-04 | 0.228 |
| 2015-05-05 | 0.229 |
| 2015-05-06 | 0.231 |
| 2015-05-07 | 0.23 |
| 2015-05-08 | 0.229 |
| 2015-05-09 | 0.229 |
| 2015-05-10 | 0.229 |
| 2015-05-11 | 0.23 |
| 2015-05-12 | 0.232 |
| 2015-05-13 | 0.23 |
| 2015-05-14 | 0.23 |
| 2015-05-15 | 0.23 |
| 2015-05-16 | 0.23 |
| 2015-05-17 | 0.23 |
| 2015-05-18 | 0.23 |
| 2015-05-19 | 0.231 |
| 2015-05-20 | 0.232 |
| 2015-05-21 | 0.231 |
| 2015-05-22 | 0.231 |
| 2015-05-23 | 0.231 |
| 2015-05-24 | 0.231 |
| 2015-05-25 | 0.231 |
| 2015-05-26 | 0.231 |
| 2015-05-27 | 0.231 |
| 2015-05-28 | 0.23 |
| 2015-05-29 | 0.229 |
| 2015-05-30 | 0.229 |
| 2015-05-31 | 0.229 |
| 2015-06-01 | 0.23 |
| 2015-06-02 | 0.231 |
| 2015-06-03 | 0.232 |
| 2015-06-04 | 0.233 |
| 2015-06-05 | 0.233 |
| 2015-06-06 | 0.233 |
| 2015-06-07 | 0.233 |
| 2015-06-08 | 0.233 |
| 2015-06-09 | 0.233 |
| 2015-06-10 | 0.232 |
| 2015-06-11 | 0.233 |
| 2015-06-12 | 0.232 |
| 2015-06-13 | 0.232 |
| 2015-06-14 | 0.232 |
| 2015-06-15 | 0.232 |
| 2015-06-16 | 0.232 |
| 2015-06-17 | 0.234 |
| 2015-06-18 | 0.233 |
| 2015-06-19 | 0.233 |
| 2015-06-20 | 0.233 |
| 2015-06-21 | 0.233 |
| 2015-06-22 | 0.234 |
| 2015-06-23 | 0.234 |
| 2015-06-24 | 0.235 |
| 2015-06-25 | 0.236 |
| 2015-06-26 | 0.239 |
| 2015-06-27 | 0.239 |
| 2015-06-28 | 0.239 |
| 2015-06-29 | 0.239 |
| 2015-06-30 | 0.238 |
| 2015-07-01 | 0.239 |
| 2015-07-02 | 0.24 |
| 2015-07-03 | 0.241 |
| 2015-07-04 | 0.241 |
| 2015-07-05 | 0.241 |
| 2015-07-06 | 0.241 |
| 2015-07-07 | 0.24 |
| 2015-07-08 | 0.239 |
| 2015-07-09 | 0.239 |
| 2015-07-10 | 0.239 |
| 2015-07-11 | 0.239 |
| 2015-07-12 | 0.239 |
| 2015-07-13 | 0.24 |
| 2015-07-14 | 0.239 |
| 2015-07-15 | 0.239 |
| 2015-07-16 | 0.238 |
| 2015-07-17 | 0.239 |
| 2015-07-18 | 0.239 |
| 2015-07-19 | 0.239 |
| 2015-07-20 | 0.239 |
| 2015-07-21 | 0.239 |
| 2015-07-22 | 0.237 |
| 2015-07-23 | 0.236 |
| 2015-07-24 | 0.24 |
| 2015-07-25 | 0.24 |
| 2015-07-26 | 0.24 |
| 2015-07-27 | 0.24 |
| 2015-07-28 | 0.24 |
| 2015-07-29 | 0.239 |
| 2015-07-30 | 0.239 |
| 2015-07-31 | 0.238 |
| 2015-08-01 | 0.238 |
| 2015-08-02 | 0.238 |
| 2015-08-03 | 0.243 |
| 2015-08-04 | 0.244 |
| 2015-08-05 | 0.248 |
| 2015-08-06 | 0.25 |
| 2015-08-07 | 0.25 |
| 2015-08-08 | 0.25 |
| 2015-08-09 | 0.25 |
| 2015-08-10 | 0.25 |
| 2015-08-11 | 0.249 |
| 2015-08-12 | 0.248 |
| 2015-08-13 | 0.249 |
| 2015-08-14 | 0.249 |
| 2015-08-15 | 0.249 |
| 2015-08-16 | 0.249 |
| 2015-08-17 | 0.249 |
| 2015-08-18 | 0.25 |
| 2015-08-19 | 0.25 |
| 2015-08-20 | 0.25 |
| 2015-08-21 | 0.256 |
| 2015-08-22 | 0.256 |
| 2015-08-23 | 0.256 |
| 2015-08-24 | 0.26 |
| 2015-08-25 | 0.259 |
| 2015-08-26 | 0.262 |
| 2015-08-27 | 0.26 |
| 2015-08-28 | 0.259 |
| 2015-08-29 | 0.259 |
| 2015-08-30 | 0.259 |
| 2015-08-31 | 0.259 |
| 2015-09-01 | 0.26 |
| 2015-09-02 | 0.266 |
| 2015-09-03 | 0.265 |
| 2015-09-04 | 0.266 |
| 2015-09-05 | 0.266 |
| 2015-09-06 | 0.266 |
| 2015-09-07 | 0.274 |
| 2015-09-08 | 0.276 |
| 2015-09-09 | 0.275 |
| 2015-09-10 | 0.273 |
| 2015-09-11 | 0.271 |
| 2015-09-12 | 0.271 |
| 2015-09-13 | 0.271 |
| 2015-09-14 | 0.272 |
| 2015-09-15 | 0.274 |
| 2015-09-16 | 0.272 |
| 2015-09-17 | 0.271 |
| 2015-09-18 | 0.265 |
| 2015-09-19 | 0.265 |
| 2015-09-20 | 0.265 |
| 2015-09-21 | 0.264 |
| 2015-09-22 | 0.268 |
| 2015-09-23 | 0.268 |
| 2015-09-24 | 0.271 |
| 2015-09-25 | 0.268 |
| 2015-09-26 | 0.268 |
| 2015-09-27 | 0.268 |
| 2015-09-28 | 0.276 |
| 2015-09-29 | 0.281 |
| 2015-09-30 | 0.279 |
| 2015-10-01 | 0.277 |
| 2015-10-02 | 0.275 |
| 2015-10-03 | 0.275 |
| 2015-10-04 | 0.275 |
| 2015-10-05 | 0.271 |
| 2015-10-06 | 0.273 |
| 2015-10-07 | 0.27 |
| 2015-10-08 | 0.27 |
| 2015-10-09 | 0.268 |
| 2015-10-10 | 0.268 |
| 2015-10-11 | 0.268 |
| 2015-10-12 | 0.268 |
| 2015-10-13 | 0.27 |
| 2015-10-14 | 0.269 |
| 2015-10-15 | 0.266 |
| 2015-10-16 | 0.265 |
| 2015-10-17 | 0.265 |
| 2015-10-18 | 0.265 |
| 2015-10-19 | 0.268 |
| 2015-10-20 | 0.269 |
| 2015-10-21 | 0.268 |
| 2015-10-22 | 0.267 |
| 2015-10-23 | 0.267 |
| 2015-10-24 | 0.267 |
| 2015-10-25 | 0.267 |
| 2015-10-26 | 0.268 |
| 2015-10-27 | 0.269 |
| 2015-10-28 | 0.267 |
| 2015-10-29 | 0.268 |
| 2015-10-30 | 0.268 |
| 2015-10-31 | 0.268 |
| 2015-11-01 | 0.268 |
| 2015-11-02 | 0.268 |
| 2015-11-03 | 0.272 |
| 2015-11-04 | 0.269 |
| 2015-11-05 | 0.272 |
| 2015-11-06 | 0.275 |
| 2015-11-07 | 0.275 |
| 2015-11-08 | 0.275 |
| 2015-11-09 | 0.276 |
| 2015-11-10 | 0.275 |
| 2015-11-11 | 0.277 |
| 2015-11-12 | 0.278 |
| 2015-11-13 | 0.279 |
| 2015-11-14 | 0.279 |
| 2015-11-15 | 0.279 |
| 2015-11-16 | 0.279 |
| 2015-11-17 | 0.278 |
| 2015-11-18 | 0.281 |
| 2015-11-19 | 0.281 |
| 2015-11-20 | 0.28 |
| 2015-11-21 | 0.28 |
| 2015-11-22 | 0.28 |
| 2015-11-23 | 0.282 |
| 2015-11-24 | 0.283 |
| 2015-11-25 | 0.285 |
| 2015-11-26 | 0.288 |
| 2015-11-27 | 0.29 |
| 2015-11-28 | 0.29 |
| 2015-11-29 | 0.29 |
| 2015-11-30 | 0.287 |
| 2015-12-01 | 0.286 |
| 2015-12-02 | 0.285 |
| 2015-12-03 | 0.288 |
| 2015-12-04 | 0.288 |
| 2015-12-05 | 0.288 |
| 2015-12-06 | 0.288 |
| 2015-12-07 | 0.291 |
| 2015-12-08 | 0.291 |
| 2015-12-09 | 0.292 |
| 2015-12-10 | 0.292 |
| 2015-12-11 | 0.295 |
| 2015-12-12 | 0.295 |
| 2015-12-13 | 0.295 |
| 2015-12-14 | 0.299 |
| 2015-12-15 | 0.298 |
| 2015-12-16 | 0.298 |
| 2015-12-17 | 0.298 |
| 2015-12-18 | 0.299 |
| 2015-12-19 | 0.299 |
| 2015-12-20 | 0.299 |
| 2015-12-21 | 0.299 |
| 2015-12-22 | 0.295 |
| 2015-12-23 | 0.294 |
| 2015-12-24 | 0.293 |
| 2015-12-25 | 0.293 |
| 2015-12-26 | 0.293 |
| 2015-12-27 | 0.293 |
| 2015-12-28 | 0.294 |
| 2015-12-29 | 0.294 |
| 2015-12-30 | 0.294 |
| 2015-12-31 | 0.294 |
| 2016-01-01 | 0.294 |
| 2016-01-02 | 0.294 |
| 2016-01-03 | 0.294 |
| 2016-01-04 | 0.296 |
| 2016-01-05 | 0.299 |
| 2016-01-06 | 0.299 |
| 2016-01-07 | 0.301 |
| 2016-01-08 | 0.301 |
| 2016-01-09 | 0.301 |
| 2016-01-10 | 0.301 |
| 2016-01-11 | 0.301 |
| 2016-01-12 | 0.302 |
| 2016-01-13 | 0.301 |
| 2016-01-14 | 0.301 |
| 2016-01-15 | 0.301 |
| 2016-01-16 | 0.301 |
| 2016-01-17 | 0.301 |
| 2016-01-18 | 0.303 |
| 2016-01-19 | 0.304 |
| 2016-01-20 | 0.308 |
| 2016-01-21 | 0.308 |
| 2016-01-22 | 0.304 |
| 2016-01-23 | 0.304 |
| 2016-01-24 | 0.304 |
| 2016-01-25 | 0.307 |
| 2016-01-26 | 0.308 |
| 2016-01-27 | 0.306 |
| 2016-01-28 | 0.305 |
| 2016-01-29 | 0.304 |
| 2016-01-30 | 0.304 |
| 2016-01-31 | 0.304 |
| 2016-02-01 | 0.306 |
| 2016-02-02 | 0.306 |
| 2016-02-03 | 0.306 |
| 2016-02-04 | 0.305 |
| 2016-02-05 | 0.305 |
| 2016-02-06 | 0.305 |
| 2016-02-07 | 0.305 |
| 2016-02-08 | 0.308 |
| 2016-02-09 | 0.309 |
| 2016-02-10 | 0.311 |
| 2016-02-11 | 0.319 |
| 2016-02-12 | 0.316 |
| 2016-02-13 | 0.316 |
| 2016-02-14 | 0.316 |
| 2016-02-15 | 0.315 |
| 2016-02-16 | 0.315 |
| 2016-02-17 | 0.316 |
| 2016-02-18 | 0.314 |
| 2016-02-19 | 0.315 |
| 2016-02-20 | 0.315 |
| 2016-02-21 | 0.315 |